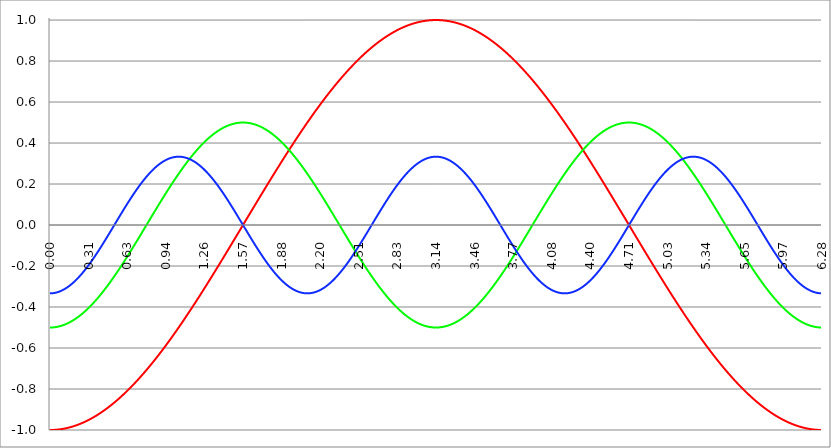
| Category | Series 1 | Series 0 | Series 2 |
|---|---|---|---|
| 0.0 | -1 | -0.5 | -0.333 |
| 0.00314159265358979 | -1 | -0.5 | -0.333 |
| 0.00628318530717958 | -1 | -0.5 | -0.333 |
| 0.00942477796076938 | -1 | -0.5 | -0.333 |
| 0.0125663706143592 | -1 | -0.5 | -0.333 |
| 0.015707963267949 | -1 | -0.5 | -0.333 |
| 0.0188495559215388 | -1 | -0.5 | -0.333 |
| 0.0219911485751285 | -1 | -0.5 | -0.333 |
| 0.0251327412287183 | -1 | -0.499 | -0.332 |
| 0.0282743338823081 | -1 | -0.499 | -0.332 |
| 0.0314159265358979 | -1 | -0.499 | -0.332 |
| 0.0345575191894877 | -0.999 | -0.499 | -0.332 |
| 0.0376991118430775 | -0.999 | -0.499 | -0.331 |
| 0.0408407044966673 | -0.999 | -0.498 | -0.331 |
| 0.0439822971502571 | -0.999 | -0.498 | -0.33 |
| 0.0471238898038469 | -0.999 | -0.498 | -0.33 |
| 0.0502654824574367 | -0.999 | -0.497 | -0.33 |
| 0.0534070751110265 | -0.999 | -0.497 | -0.329 |
| 0.0565486677646163 | -0.998 | -0.497 | -0.329 |
| 0.059690260418206 | -0.998 | -0.496 | -0.328 |
| 0.0628318530717958 | -0.998 | -0.496 | -0.327 |
| 0.0659734457253856 | -0.998 | -0.496 | -0.327 |
| 0.0691150383789754 | -0.998 | -0.495 | -0.326 |
| 0.0722566310325652 | -0.997 | -0.495 | -0.326 |
| 0.075398223686155 | -0.997 | -0.494 | -0.325 |
| 0.0785398163397448 | -0.997 | -0.494 | -0.324 |
| 0.0816814089933346 | -0.997 | -0.493 | -0.323 |
| 0.0848230016469244 | -0.996 | -0.493 | -0.323 |
| 0.0879645943005142 | -0.996 | -0.492 | -0.322 |
| 0.091106186954104 | -0.996 | -0.492 | -0.321 |
| 0.0942477796076937 | -0.996 | -0.491 | -0.32 |
| 0.0973893722612835 | -0.995 | -0.491 | -0.319 |
| 0.100530964914873 | -0.995 | -0.49 | -0.318 |
| 0.103672557568463 | -0.995 | -0.489 | -0.317 |
| 0.106814150222053 | -0.994 | -0.489 | -0.316 |
| 0.109955742875643 | -0.994 | -0.488 | -0.315 |
| 0.113097335529233 | -0.994 | -0.487 | -0.314 |
| 0.116238928182822 | -0.993 | -0.487 | -0.313 |
| 0.119380520836412 | -0.993 | -0.486 | -0.312 |
| 0.122522113490002 | -0.993 | -0.485 | -0.311 |
| 0.125663706143592 | -0.992 | -0.484 | -0.31 |
| 0.128805298797181 | -0.992 | -0.484 | -0.309 |
| 0.131946891450771 | -0.991 | -0.483 | -0.308 |
| 0.135088484104361 | -0.991 | -0.482 | -0.306 |
| 0.138230076757951 | -0.99 | -0.481 | -0.305 |
| 0.141371669411541 | -0.99 | -0.48 | -0.304 |
| 0.14451326206513 | -0.99 | -0.479 | -0.302 |
| 0.14765485471872 | -0.989 | -0.478 | -0.301 |
| 0.15079644737231 | -0.989 | -0.477 | -0.3 |
| 0.1539380400259 | -0.988 | -0.476 | -0.298 |
| 0.15707963267949 | -0.988 | -0.476 | -0.297 |
| 0.160221225333079 | -0.987 | -0.475 | -0.296 |
| 0.163362817986669 | -0.987 | -0.474 | -0.294 |
| 0.166504410640259 | -0.986 | -0.473 | -0.293 |
| 0.169646003293849 | -0.986 | -0.471 | -0.291 |
| 0.172787595947439 | -0.985 | -0.47 | -0.29 |
| 0.175929188601028 | -0.985 | -0.469 | -0.288 |
| 0.179070781254618 | -0.984 | -0.468 | -0.286 |
| 0.182212373908208 | -0.983 | -0.467 | -0.285 |
| 0.185353966561798 | -0.983 | -0.466 | -0.283 |
| 0.188495559215388 | -0.982 | -0.465 | -0.281 |
| 0.191637151868977 | -0.982 | -0.464 | -0.28 |
| 0.194778744522567 | -0.981 | -0.463 | -0.278 |
| 0.197920337176157 | -0.98 | -0.461 | -0.276 |
| 0.201061929829747 | -0.98 | -0.46 | -0.275 |
| 0.204203522483336 | -0.979 | -0.459 | -0.273 |
| 0.207345115136926 | -0.979 | -0.458 | -0.271 |
| 0.210486707790516 | -0.978 | -0.456 | -0.269 |
| 0.213628300444106 | -0.977 | -0.455 | -0.267 |
| 0.216769893097696 | -0.977 | -0.454 | -0.265 |
| 0.219911485751285 | -0.976 | -0.452 | -0.263 |
| 0.223053078404875 | -0.975 | -0.451 | -0.261 |
| 0.226194671058465 | -0.975 | -0.45 | -0.259 |
| 0.229336263712055 | -0.974 | -0.448 | -0.258 |
| 0.232477856365645 | -0.973 | -0.447 | -0.255 |
| 0.235619449019234 | -0.972 | -0.446 | -0.253 |
| 0.238761041672824 | -0.972 | -0.444 | -0.251 |
| 0.241902634326414 | -0.971 | -0.443 | -0.249 |
| 0.245044226980004 | -0.97 | -0.441 | -0.247 |
| 0.248185819633594 | -0.969 | -0.44 | -0.245 |
| 0.251327412287183 | -0.969 | -0.438 | -0.243 |
| 0.254469004940773 | -0.968 | -0.437 | -0.241 |
| 0.257610597594363 | -0.967 | -0.435 | -0.239 |
| 0.260752190247953 | -0.966 | -0.434 | -0.236 |
| 0.263893782901543 | -0.965 | -0.432 | -0.234 |
| 0.267035375555132 | -0.965 | -0.43 | -0.232 |
| 0.270176968208722 | -0.964 | -0.429 | -0.23 |
| 0.273318560862312 | -0.963 | -0.427 | -0.227 |
| 0.276460153515902 | -0.962 | -0.425 | -0.225 |
| 0.279601746169492 | -0.961 | -0.424 | -0.223 |
| 0.282743338823082 | -0.96 | -0.422 | -0.22 |
| 0.285884931476671 | -0.959 | -0.42 | -0.218 |
| 0.289026524130261 | -0.959 | -0.419 | -0.216 |
| 0.292168116783851 | -0.958 | -0.417 | -0.213 |
| 0.295309709437441 | -0.957 | -0.415 | -0.211 |
| 0.298451302091031 | -0.956 | -0.414 | -0.208 |
| 0.30159289474462 | -0.955 | -0.412 | -0.206 |
| 0.30473448739821 | -0.954 | -0.41 | -0.203 |
| 0.3078760800518 | -0.953 | -0.408 | -0.201 |
| 0.31101767270539 | -0.952 | -0.406 | -0.198 |
| 0.31415926535898 | -0.951 | -0.405 | -0.196 |
| 0.31730085801257 | -0.95 | -0.403 | -0.193 |
| 0.320442450666159 | -0.949 | -0.401 | -0.191 |
| 0.323584043319749 | -0.948 | -0.399 | -0.188 |
| 0.326725635973339 | -0.947 | -0.397 | -0.186 |
| 0.329867228626929 | -0.946 | -0.395 | -0.183 |
| 0.333008821280519 | -0.945 | -0.393 | -0.18 |
| 0.336150413934108 | -0.944 | -0.391 | -0.178 |
| 0.339292006587698 | -0.943 | -0.389 | -0.175 |
| 0.342433599241288 | -0.942 | -0.387 | -0.172 |
| 0.345575191894878 | -0.941 | -0.385 | -0.17 |
| 0.348716784548468 | -0.94 | -0.383 | -0.167 |
| 0.351858377202058 | -0.939 | -0.381 | -0.164 |
| 0.354999969855647 | -0.938 | -0.379 | -0.162 |
| 0.358141562509237 | -0.937 | -0.377 | -0.159 |
| 0.361283155162827 | -0.935 | -0.375 | -0.156 |
| 0.364424747816417 | -0.934 | -0.373 | -0.153 |
| 0.367566340470007 | -0.933 | -0.371 | -0.15 |
| 0.370707933123597 | -0.932 | -0.369 | -0.148 |
| 0.373849525777186 | -0.931 | -0.367 | -0.145 |
| 0.376991118430776 | -0.93 | -0.364 | -0.142 |
| 0.380132711084366 | -0.929 | -0.362 | -0.139 |
| 0.383274303737956 | -0.927 | -0.36 | -0.136 |
| 0.386415896391546 | -0.926 | -0.358 | -0.133 |
| 0.389557489045135 | -0.925 | -0.356 | -0.13 |
| 0.392699081698725 | -0.924 | -0.354 | -0.128 |
| 0.395840674352315 | -0.923 | -0.351 | -0.125 |
| 0.398982267005905 | -0.921 | -0.349 | -0.122 |
| 0.402123859659495 | -0.92 | -0.347 | -0.119 |
| 0.405265452313085 | -0.919 | -0.345 | -0.116 |
| 0.408407044966674 | -0.918 | -0.342 | -0.113 |
| 0.411548637620264 | -0.917 | -0.34 | -0.11 |
| 0.414690230273854 | -0.915 | -0.338 | -0.107 |
| 0.417831822927444 | -0.914 | -0.335 | -0.104 |
| 0.420973415581034 | -0.913 | -0.333 | -0.101 |
| 0.424115008234623 | -0.911 | -0.331 | -0.098 |
| 0.427256600888213 | -0.91 | -0.328 | -0.095 |
| 0.430398193541803 | -0.909 | -0.326 | -0.092 |
| 0.433539786195393 | -0.907 | -0.324 | -0.089 |
| 0.436681378848983 | -0.906 | -0.321 | -0.086 |
| 0.439822971502573 | -0.905 | -0.319 | -0.083 |
| 0.442964564156162 | -0.903 | -0.316 | -0.08 |
| 0.446106156809752 | -0.902 | -0.314 | -0.077 |
| 0.449247749463342 | -0.901 | -0.311 | -0.074 |
| 0.452389342116932 | -0.899 | -0.309 | -0.071 |
| 0.455530934770522 | -0.898 | -0.306 | -0.068 |
| 0.458672527424111 | -0.897 | -0.304 | -0.065 |
| 0.461814120077701 | -0.895 | -0.301 | -0.061 |
| 0.464955712731291 | -0.894 | -0.299 | -0.058 |
| 0.468097305384881 | -0.892 | -0.296 | -0.055 |
| 0.471238898038471 | -0.891 | -0.294 | -0.052 |
| 0.474380490692061 | -0.89 | -0.291 | -0.049 |
| 0.47752208334565 | -0.888 | -0.289 | -0.046 |
| 0.48066367599924 | -0.887 | -0.286 | -0.043 |
| 0.48380526865283 | -0.885 | -0.284 | -0.04 |
| 0.48694686130642 | -0.884 | -0.281 | -0.037 |
| 0.49008845396001 | -0.882 | -0.278 | -0.033 |
| 0.493230046613599 | -0.881 | -0.276 | -0.03 |
| 0.496371639267189 | -0.879 | -0.273 | -0.027 |
| 0.499513231920779 | -0.878 | -0.271 | -0.024 |
| 0.502654824574369 | -0.876 | -0.268 | -0.021 |
| 0.505796417227959 | -0.875 | -0.265 | -0.018 |
| 0.508938009881549 | -0.873 | -0.263 | -0.015 |
| 0.512079602535138 | -0.872 | -0.26 | -0.012 |
| 0.515221195188728 | -0.87 | -0.257 | -0.008 |
| 0.518362787842318 | -0.869 | -0.255 | -0.005 |
| 0.521504380495908 | -0.867 | -0.252 | -0.002 |
| 0.524645973149498 | -0.866 | -0.249 | 0.001 |
| 0.527787565803087 | -0.864 | -0.246 | 0.004 |
| 0.530929158456677 | -0.862 | -0.244 | 0.007 |
| 0.534070751110267 | -0.861 | -0.241 | 0.01 |
| 0.537212343763857 | -0.859 | -0.238 | 0.014 |
| 0.540353936417447 | -0.858 | -0.235 | 0.017 |
| 0.543495529071037 | -0.856 | -0.233 | 0.02 |
| 0.546637121724626 | -0.854 | -0.23 | 0.023 |
| 0.549778714378216 | -0.853 | -0.227 | 0.026 |
| 0.552920307031806 | -0.851 | -0.224 | 0.029 |
| 0.556061899685396 | -0.849 | -0.221 | 0.032 |
| 0.559203492338986 | -0.848 | -0.219 | 0.036 |
| 0.562345084992576 | -0.846 | -0.216 | 0.039 |
| 0.565486677646165 | -0.844 | -0.213 | 0.042 |
| 0.568628270299755 | -0.843 | -0.21 | 0.045 |
| 0.571769862953345 | -0.841 | -0.207 | 0.048 |
| 0.574911455606935 | -0.839 | -0.204 | 0.051 |
| 0.578053048260525 | -0.838 | -0.201 | 0.054 |
| 0.581194640914114 | -0.836 | -0.199 | 0.057 |
| 0.584336233567704 | -0.834 | -0.196 | 0.06 |
| 0.587477826221294 | -0.832 | -0.193 | 0.063 |
| 0.590619418874884 | -0.831 | -0.19 | 0.067 |
| 0.593761011528474 | -0.829 | -0.187 | 0.07 |
| 0.596902604182064 | -0.827 | -0.184 | 0.073 |
| 0.600044196835653 | -0.825 | -0.181 | 0.076 |
| 0.603185789489243 | -0.824 | -0.178 | 0.079 |
| 0.606327382142833 | -0.822 | -0.175 | 0.082 |
| 0.609468974796423 | -0.82 | -0.172 | 0.085 |
| 0.612610567450013 | -0.818 | -0.169 | 0.088 |
| 0.615752160103602 | -0.816 | -0.166 | 0.091 |
| 0.618893752757192 | -0.815 | -0.163 | 0.094 |
| 0.622035345410782 | -0.813 | -0.16 | 0.097 |
| 0.625176938064372 | -0.811 | -0.157 | 0.1 |
| 0.628318530717962 | -0.809 | -0.155 | 0.103 |
| 0.631460123371551 | -0.807 | -0.152 | 0.106 |
| 0.634601716025141 | -0.805 | -0.149 | 0.109 |
| 0.637743308678731 | -0.803 | -0.146 | 0.112 |
| 0.640884901332321 | -0.802 | -0.143 | 0.115 |
| 0.644026493985911 | -0.8 | -0.139 | 0.118 |
| 0.647168086639501 | -0.798 | -0.136 | 0.121 |
| 0.65030967929309 | -0.796 | -0.133 | 0.124 |
| 0.65345127194668 | -0.794 | -0.13 | 0.127 |
| 0.65659286460027 | -0.792 | -0.127 | 0.129 |
| 0.65973445725386 | -0.79 | -0.124 | 0.132 |
| 0.66287604990745 | -0.788 | -0.121 | 0.135 |
| 0.666017642561039 | -0.786 | -0.118 | 0.138 |
| 0.669159235214629 | -0.784 | -0.115 | 0.141 |
| 0.672300827868219 | -0.782 | -0.112 | 0.144 |
| 0.675442420521809 | -0.78 | -0.109 | 0.147 |
| 0.678584013175399 | -0.778 | -0.106 | 0.149 |
| 0.681725605828989 | -0.776 | -0.103 | 0.152 |
| 0.684867198482578 | -0.775 | -0.1 | 0.155 |
| 0.688008791136168 | -0.773 | -0.097 | 0.158 |
| 0.691150383789758 | -0.771 | -0.094 | 0.161 |
| 0.694291976443348 | -0.769 | -0.091 | 0.163 |
| 0.697433569096938 | -0.766 | -0.088 | 0.166 |
| 0.700575161750528 | -0.764 | -0.084 | 0.169 |
| 0.703716754404117 | -0.762 | -0.081 | 0.171 |
| 0.706858347057707 | -0.76 | -0.078 | 0.174 |
| 0.709999939711297 | -0.758 | -0.075 | 0.177 |
| 0.713141532364887 | -0.756 | -0.072 | 0.179 |
| 0.716283125018477 | -0.754 | -0.069 | 0.182 |
| 0.719424717672066 | -0.752 | -0.066 | 0.185 |
| 0.722566310325656 | -0.75 | -0.063 | 0.187 |
| 0.725707902979246 | -0.748 | -0.06 | 0.19 |
| 0.728849495632836 | -0.746 | -0.056 | 0.193 |
| 0.731991088286426 | -0.744 | -0.053 | 0.195 |
| 0.735132680940016 | -0.742 | -0.05 | 0.198 |
| 0.738274273593605 | -0.74 | -0.047 | 0.2 |
| 0.741415866247195 | -0.738 | -0.044 | 0.203 |
| 0.744557458900785 | -0.735 | -0.041 | 0.205 |
| 0.747699051554375 | -0.733 | -0.038 | 0.208 |
| 0.750840644207965 | -0.731 | -0.035 | 0.21 |
| 0.753982236861554 | -0.729 | -0.031 | 0.212 |
| 0.757123829515144 | -0.727 | -0.028 | 0.215 |
| 0.760265422168734 | -0.725 | -0.025 | 0.217 |
| 0.763407014822324 | -0.722 | -0.022 | 0.22 |
| 0.766548607475914 | -0.72 | -0.019 | 0.222 |
| 0.769690200129504 | -0.718 | -0.016 | 0.224 |
| 0.772831792783093 | -0.716 | -0.013 | 0.227 |
| 0.775973385436683 | -0.714 | -0.009 | 0.229 |
| 0.779114978090273 | -0.712 | -0.006 | 0.231 |
| 0.782256570743863 | -0.709 | -0.003 | 0.233 |
| 0.785398163397453 | -0.707 | 0 | 0.236 |
| 0.788539756051042 | -0.705 | 0.003 | 0.238 |
| 0.791681348704632 | -0.703 | 0.006 | 0.24 |
| 0.794822941358222 | -0.7 | 0.009 | 0.242 |
| 0.797964534011812 | -0.698 | 0.013 | 0.244 |
| 0.801106126665402 | -0.696 | 0.016 | 0.247 |
| 0.804247719318992 | -0.694 | 0.019 | 0.249 |
| 0.807389311972581 | -0.691 | 0.022 | 0.251 |
| 0.810530904626171 | -0.689 | 0.025 | 0.253 |
| 0.813672497279761 | -0.687 | 0.028 | 0.255 |
| 0.816814089933351 | -0.685 | 0.031 | 0.257 |
| 0.819955682586941 | -0.682 | 0.035 | 0.259 |
| 0.823097275240531 | -0.68 | 0.038 | 0.261 |
| 0.82623886789412 | -0.678 | 0.041 | 0.263 |
| 0.82938046054771 | -0.675 | 0.044 | 0.265 |
| 0.8325220532013 | -0.673 | 0.047 | 0.267 |
| 0.83566364585489 | -0.671 | 0.05 | 0.268 |
| 0.83880523850848 | -0.668 | 0.053 | 0.27 |
| 0.841946831162069 | -0.666 | 0.056 | 0.272 |
| 0.845088423815659 | -0.664 | 0.06 | 0.274 |
| 0.848230016469249 | -0.661 | 0.063 | 0.276 |
| 0.851371609122839 | -0.659 | 0.066 | 0.277 |
| 0.854513201776429 | -0.657 | 0.069 | 0.279 |
| 0.857654794430019 | -0.654 | 0.072 | 0.281 |
| 0.860796387083608 | -0.652 | 0.075 | 0.283 |
| 0.863937979737198 | -0.649 | 0.078 | 0.284 |
| 0.867079572390788 | -0.647 | 0.081 | 0.286 |
| 0.870221165044378 | -0.645 | 0.084 | 0.287 |
| 0.873362757697968 | -0.642 | 0.088 | 0.289 |
| 0.876504350351557 | -0.64 | 0.091 | 0.291 |
| 0.879645943005147 | -0.637 | 0.094 | 0.292 |
| 0.882787535658737 | -0.635 | 0.097 | 0.294 |
| 0.885929128312327 | -0.633 | 0.1 | 0.295 |
| 0.889070720965917 | -0.63 | 0.103 | 0.297 |
| 0.892212313619507 | -0.628 | 0.106 | 0.298 |
| 0.895353906273096 | -0.625 | 0.109 | 0.299 |
| 0.898495498926686 | -0.623 | 0.112 | 0.301 |
| 0.901637091580276 | -0.62 | 0.115 | 0.302 |
| 0.904778684233866 | -0.618 | 0.118 | 0.303 |
| 0.907920276887456 | -0.615 | 0.121 | 0.305 |
| 0.911061869541045 | -0.613 | 0.124 | 0.306 |
| 0.914203462194635 | -0.61 | 0.127 | 0.307 |
| 0.917345054848225 | -0.608 | 0.13 | 0.308 |
| 0.920486647501815 | -0.605 | 0.133 | 0.31 |
| 0.923628240155405 | -0.603 | 0.136 | 0.311 |
| 0.926769832808995 | -0.6 | 0.139 | 0.312 |
| 0.929911425462584 | -0.598 | 0.143 | 0.313 |
| 0.933053018116174 | -0.595 | 0.146 | 0.314 |
| 0.936194610769764 | -0.593 | 0.149 | 0.315 |
| 0.939336203423354 | -0.59 | 0.152 | 0.316 |
| 0.942477796076944 | -0.588 | 0.155 | 0.317 |
| 0.945619388730533 | -0.585 | 0.157 | 0.318 |
| 0.948760981384123 | -0.583 | 0.16 | 0.319 |
| 0.951902574037713 | -0.58 | 0.163 | 0.32 |
| 0.955044166691303 | -0.578 | 0.166 | 0.321 |
| 0.958185759344893 | -0.575 | 0.169 | 0.322 |
| 0.961327351998483 | -0.572 | 0.172 | 0.322 |
| 0.964468944652072 | -0.57 | 0.175 | 0.323 |
| 0.967610537305662 | -0.567 | 0.178 | 0.324 |
| 0.970752129959252 | -0.565 | 0.181 | 0.325 |
| 0.973893722612842 | -0.562 | 0.184 | 0.325 |
| 0.977035315266432 | -0.559 | 0.187 | 0.326 |
| 0.980176907920022 | -0.557 | 0.19 | 0.327 |
| 0.983318500573611 | -0.554 | 0.193 | 0.327 |
| 0.986460093227201 | -0.552 | 0.196 | 0.328 |
| 0.989601685880791 | -0.549 | 0.199 | 0.328 |
| 0.992743278534381 | -0.546 | 0.201 | 0.329 |
| 0.995884871187971 | -0.544 | 0.204 | 0.329 |
| 0.99902646384156 | -0.541 | 0.207 | 0.33 |
| 1.00216805649515 | -0.538 | 0.21 | 0.33 |
| 1.00530964914874 | -0.536 | 0.213 | 0.331 |
| 1.00845124180233 | -0.533 | 0.216 | 0.331 |
| 1.01159283445592 | -0.531 | 0.219 | 0.331 |
| 1.01473442710951 | -0.528 | 0.221 | 0.332 |
| 1.017876019763099 | -0.525 | 0.224 | 0.332 |
| 1.021017612416689 | -0.522 | 0.227 | 0.332 |
| 1.02415920507028 | -0.52 | 0.23 | 0.333 |
| 1.027300797723869 | -0.517 | 0.233 | 0.333 |
| 1.030442390377459 | -0.514 | 0.235 | 0.333 |
| 1.033583983031048 | -0.512 | 0.238 | 0.333 |
| 1.036725575684638 | -0.509 | 0.241 | 0.333 |
| 1.039867168338228 | -0.506 | 0.244 | 0.333 |
| 1.043008760991818 | -0.504 | 0.246 | 0.333 |
| 1.046150353645408 | -0.501 | 0.249 | 0.333 |
| 1.049291946298998 | -0.498 | 0.252 | 0.333 |
| 1.052433538952587 | -0.495 | 0.255 | 0.333 |
| 1.055575131606177 | -0.493 | 0.257 | 0.333 |
| 1.058716724259767 | -0.49 | 0.26 | 0.333 |
| 1.061858316913357 | -0.487 | 0.263 | 0.333 |
| 1.064999909566947 | -0.485 | 0.265 | 0.333 |
| 1.068141502220536 | -0.482 | 0.268 | 0.333 |
| 1.071283094874126 | -0.479 | 0.271 | 0.332 |
| 1.074424687527716 | -0.476 | 0.273 | 0.332 |
| 1.077566280181306 | -0.473 | 0.276 | 0.332 |
| 1.080707872834896 | -0.471 | 0.278 | 0.332 |
| 1.083849465488486 | -0.468 | 0.281 | 0.331 |
| 1.086991058142075 | -0.465 | 0.284 | 0.331 |
| 1.090132650795665 | -0.462 | 0.286 | 0.331 |
| 1.093274243449255 | -0.46 | 0.289 | 0.33 |
| 1.096415836102845 | -0.457 | 0.291 | 0.33 |
| 1.099557428756435 | -0.454 | 0.294 | 0.329 |
| 1.102699021410025 | -0.451 | 0.296 | 0.329 |
| 1.105840614063614 | -0.448 | 0.299 | 0.328 |
| 1.108982206717204 | -0.446 | 0.301 | 0.328 |
| 1.112123799370794 | -0.443 | 0.304 | 0.327 |
| 1.115265392024384 | -0.44 | 0.306 | 0.326 |
| 1.118406984677974 | -0.437 | 0.309 | 0.326 |
| 1.121548577331563 | -0.434 | 0.311 | 0.325 |
| 1.124690169985153 | -0.431 | 0.314 | 0.324 |
| 1.127831762638743 | -0.429 | 0.316 | 0.324 |
| 1.130973355292333 | -0.426 | 0.319 | 0.323 |
| 1.134114947945923 | -0.423 | 0.321 | 0.322 |
| 1.137256540599513 | -0.42 | 0.324 | 0.321 |
| 1.140398133253102 | -0.417 | 0.326 | 0.32 |
| 1.143539725906692 | -0.414 | 0.328 | 0.32 |
| 1.146681318560282 | -0.412 | 0.331 | 0.319 |
| 1.149822911213872 | -0.409 | 0.333 | 0.318 |
| 1.152964503867462 | -0.406 | 0.335 | 0.317 |
| 1.156106096521051 | -0.403 | 0.338 | 0.316 |
| 1.159247689174641 | -0.4 | 0.34 | 0.315 |
| 1.162389281828231 | -0.397 | 0.342 | 0.314 |
| 1.165530874481821 | -0.394 | 0.345 | 0.313 |
| 1.168672467135411 | -0.391 | 0.347 | 0.311 |
| 1.171814059789001 | -0.388 | 0.349 | 0.31 |
| 1.17495565244259 | -0.386 | 0.351 | 0.309 |
| 1.17809724509618 | -0.383 | 0.354 | 0.308 |
| 1.18123883774977 | -0.38 | 0.356 | 0.307 |
| 1.18438043040336 | -0.377 | 0.358 | 0.306 |
| 1.18752202305695 | -0.374 | 0.36 | 0.304 |
| 1.190663615710539 | -0.371 | 0.362 | 0.303 |
| 1.193805208364129 | -0.368 | 0.364 | 0.302 |
| 1.19694680101772 | -0.365 | 0.367 | 0.3 |
| 1.200088393671309 | -0.362 | 0.369 | 0.299 |
| 1.203229986324899 | -0.359 | 0.371 | 0.297 |
| 1.206371578978489 | -0.356 | 0.373 | 0.296 |
| 1.209513171632078 | -0.353 | 0.375 | 0.295 |
| 1.212654764285668 | -0.351 | 0.377 | 0.293 |
| 1.215796356939258 | -0.348 | 0.379 | 0.292 |
| 1.218937949592848 | -0.345 | 0.381 | 0.29 |
| 1.222079542246438 | -0.342 | 0.383 | 0.289 |
| 1.225221134900027 | -0.339 | 0.385 | 0.287 |
| 1.228362727553617 | -0.336 | 0.387 | 0.285 |
| 1.231504320207207 | -0.333 | 0.389 | 0.284 |
| 1.234645912860797 | -0.33 | 0.391 | 0.282 |
| 1.237787505514387 | -0.327 | 0.393 | 0.28 |
| 1.240929098167977 | -0.324 | 0.395 | 0.279 |
| 1.244070690821566 | -0.321 | 0.397 | 0.277 |
| 1.247212283475156 | -0.318 | 0.399 | 0.275 |
| 1.250353876128746 | -0.315 | 0.401 | 0.273 |
| 1.253495468782336 | -0.312 | 0.403 | 0.272 |
| 1.256637061435926 | -0.309 | 0.405 | 0.27 |
| 1.259778654089515 | -0.306 | 0.406 | 0.268 |
| 1.262920246743105 | -0.303 | 0.408 | 0.266 |
| 1.266061839396695 | -0.3 | 0.41 | 0.264 |
| 1.269203432050285 | -0.297 | 0.412 | 0.262 |
| 1.272345024703875 | -0.294 | 0.414 | 0.26 |
| 1.275486617357465 | -0.291 | 0.415 | 0.258 |
| 1.278628210011054 | -0.288 | 0.417 | 0.256 |
| 1.281769802664644 | -0.285 | 0.419 | 0.254 |
| 1.284911395318234 | -0.282 | 0.42 | 0.252 |
| 1.288052987971824 | -0.279 | 0.422 | 0.25 |
| 1.291194580625414 | -0.276 | 0.424 | 0.248 |
| 1.294336173279003 | -0.273 | 0.425 | 0.246 |
| 1.297477765932593 | -0.27 | 0.427 | 0.244 |
| 1.300619358586183 | -0.267 | 0.429 | 0.242 |
| 1.303760951239773 | -0.264 | 0.43 | 0.239 |
| 1.306902543893363 | -0.261 | 0.432 | 0.237 |
| 1.310044136546953 | -0.258 | 0.434 | 0.235 |
| 1.313185729200542 | -0.255 | 0.435 | 0.233 |
| 1.316327321854132 | -0.252 | 0.437 | 0.23 |
| 1.319468914507722 | -0.249 | 0.438 | 0.228 |
| 1.322610507161312 | -0.246 | 0.44 | 0.226 |
| 1.325752099814902 | -0.243 | 0.441 | 0.224 |
| 1.328893692468491 | -0.24 | 0.443 | 0.221 |
| 1.332035285122081 | -0.236 | 0.444 | 0.219 |
| 1.335176877775671 | -0.233 | 0.446 | 0.216 |
| 1.338318470429261 | -0.23 | 0.447 | 0.214 |
| 1.341460063082851 | -0.227 | 0.448 | 0.212 |
| 1.344601655736441 | -0.224 | 0.45 | 0.209 |
| 1.34774324839003 | -0.221 | 0.451 | 0.207 |
| 1.35088484104362 | -0.218 | 0.452 | 0.204 |
| 1.35402643369721 | -0.215 | 0.454 | 0.202 |
| 1.3571680263508 | -0.212 | 0.455 | 0.199 |
| 1.36030961900439 | -0.209 | 0.456 | 0.197 |
| 1.363451211657979 | -0.206 | 0.458 | 0.194 |
| 1.36659280431157 | -0.203 | 0.459 | 0.192 |
| 1.369734396965159 | -0.2 | 0.46 | 0.189 |
| 1.372875989618749 | -0.197 | 0.461 | 0.186 |
| 1.376017582272339 | -0.194 | 0.463 | 0.184 |
| 1.379159174925929 | -0.19 | 0.464 | 0.181 |
| 1.382300767579518 | -0.187 | 0.465 | 0.179 |
| 1.385442360233108 | -0.184 | 0.466 | 0.176 |
| 1.388583952886698 | -0.181 | 0.467 | 0.173 |
| 1.391725545540288 | -0.178 | 0.468 | 0.171 |
| 1.394867138193878 | -0.175 | 0.469 | 0.168 |
| 1.398008730847468 | -0.172 | 0.47 | 0.165 |
| 1.401150323501057 | -0.169 | 0.471 | 0.162 |
| 1.404291916154647 | -0.166 | 0.473 | 0.16 |
| 1.407433508808237 | -0.163 | 0.474 | 0.157 |
| 1.410575101461827 | -0.16 | 0.475 | 0.154 |
| 1.413716694115417 | -0.156 | 0.476 | 0.151 |
| 1.416858286769006 | -0.153 | 0.476 | 0.149 |
| 1.419999879422596 | -0.15 | 0.477 | 0.146 |
| 1.423141472076186 | -0.147 | 0.478 | 0.143 |
| 1.426283064729776 | -0.144 | 0.479 | 0.14 |
| 1.429424657383366 | -0.141 | 0.48 | 0.137 |
| 1.432566250036956 | -0.138 | 0.481 | 0.134 |
| 1.435707842690545 | -0.135 | 0.482 | 0.131 |
| 1.438849435344135 | -0.132 | 0.483 | 0.129 |
| 1.441991027997725 | -0.128 | 0.484 | 0.126 |
| 1.445132620651315 | -0.125 | 0.484 | 0.123 |
| 1.448274213304905 | -0.122 | 0.485 | 0.12 |
| 1.451415805958494 | -0.119 | 0.486 | 0.117 |
| 1.454557398612084 | -0.116 | 0.487 | 0.114 |
| 1.457698991265674 | -0.113 | 0.487 | 0.111 |
| 1.460840583919264 | -0.11 | 0.488 | 0.108 |
| 1.463982176572854 | -0.107 | 0.489 | 0.105 |
| 1.467123769226444 | -0.103 | 0.489 | 0.102 |
| 1.470265361880033 | -0.1 | 0.49 | 0.099 |
| 1.473406954533623 | -0.097 | 0.491 | 0.096 |
| 1.476548547187213 | -0.094 | 0.491 | 0.093 |
| 1.479690139840803 | -0.091 | 0.492 | 0.09 |
| 1.482831732494393 | -0.088 | 0.492 | 0.087 |
| 1.485973325147982 | -0.085 | 0.493 | 0.084 |
| 1.489114917801572 | -0.082 | 0.493 | 0.081 |
| 1.492256510455162 | -0.078 | 0.494 | 0.078 |
| 1.495398103108752 | -0.075 | 0.494 | 0.075 |
| 1.498539695762342 | -0.072 | 0.495 | 0.072 |
| 1.501681288415932 | -0.069 | 0.495 | 0.069 |
| 1.504822881069521 | -0.066 | 0.496 | 0.066 |
| 1.507964473723111 | -0.063 | 0.496 | 0.062 |
| 1.511106066376701 | -0.06 | 0.496 | 0.059 |
| 1.514247659030291 | -0.057 | 0.497 | 0.056 |
| 1.517389251683881 | -0.053 | 0.497 | 0.053 |
| 1.520530844337471 | -0.05 | 0.497 | 0.05 |
| 1.52367243699106 | -0.047 | 0.498 | 0.047 |
| 1.52681402964465 | -0.044 | 0.498 | 0.044 |
| 1.52995562229824 | -0.041 | 0.498 | 0.041 |
| 1.53309721495183 | -0.038 | 0.499 | 0.038 |
| 1.53623880760542 | -0.035 | 0.499 | 0.034 |
| 1.539380400259009 | -0.031 | 0.499 | 0.031 |
| 1.542521992912599 | -0.028 | 0.499 | 0.028 |
| 1.545663585566189 | -0.025 | 0.499 | 0.025 |
| 1.548805178219779 | -0.022 | 0.5 | 0.022 |
| 1.551946770873369 | -0.019 | 0.5 | 0.019 |
| 1.555088363526959 | -0.016 | 0.5 | 0.016 |
| 1.558229956180548 | -0.013 | 0.5 | 0.013 |
| 1.561371548834138 | -0.009 | 0.5 | 0.009 |
| 1.564513141487728 | -0.006 | 0.5 | 0.006 |
| 1.567654734141318 | -0.003 | 0.5 | 0.003 |
| 1.570796326794908 | 0 | 0.5 | 0 |
| 1.573937919448497 | 0.003 | 0.5 | -0.003 |
| 1.577079512102087 | 0.006 | 0.5 | -0.006 |
| 1.580221104755677 | 0.009 | 0.5 | -0.009 |
| 1.583362697409267 | 0.013 | 0.5 | -0.013 |
| 1.586504290062857 | 0.016 | 0.5 | -0.016 |
| 1.589645882716447 | 0.019 | 0.5 | -0.019 |
| 1.592787475370036 | 0.022 | 0.5 | -0.022 |
| 1.595929068023626 | 0.025 | 0.499 | -0.025 |
| 1.599070660677216 | 0.028 | 0.499 | -0.028 |
| 1.602212253330806 | 0.031 | 0.499 | -0.031 |
| 1.605353845984396 | 0.035 | 0.499 | -0.034 |
| 1.608495438637985 | 0.038 | 0.499 | -0.038 |
| 1.611637031291575 | 0.041 | 0.498 | -0.041 |
| 1.614778623945165 | 0.044 | 0.498 | -0.044 |
| 1.617920216598755 | 0.047 | 0.498 | -0.047 |
| 1.621061809252345 | 0.05 | 0.497 | -0.05 |
| 1.624203401905935 | 0.053 | 0.497 | -0.053 |
| 1.627344994559524 | 0.057 | 0.497 | -0.056 |
| 1.630486587213114 | 0.06 | 0.496 | -0.059 |
| 1.633628179866704 | 0.063 | 0.496 | -0.062 |
| 1.636769772520294 | 0.066 | 0.496 | -0.066 |
| 1.639911365173884 | 0.069 | 0.495 | -0.069 |
| 1.643052957827473 | 0.072 | 0.495 | -0.072 |
| 1.646194550481063 | 0.075 | 0.494 | -0.075 |
| 1.649336143134653 | 0.078 | 0.494 | -0.078 |
| 1.652477735788243 | 0.082 | 0.493 | -0.081 |
| 1.655619328441833 | 0.085 | 0.493 | -0.084 |
| 1.658760921095423 | 0.088 | 0.492 | -0.087 |
| 1.661902513749012 | 0.091 | 0.492 | -0.09 |
| 1.665044106402602 | 0.094 | 0.491 | -0.093 |
| 1.668185699056192 | 0.097 | 0.491 | -0.096 |
| 1.671327291709782 | 0.1 | 0.49 | -0.099 |
| 1.674468884363372 | 0.103 | 0.489 | -0.102 |
| 1.677610477016961 | 0.107 | 0.489 | -0.105 |
| 1.680752069670551 | 0.11 | 0.488 | -0.108 |
| 1.683893662324141 | 0.113 | 0.487 | -0.111 |
| 1.687035254977731 | 0.116 | 0.487 | -0.114 |
| 1.690176847631321 | 0.119 | 0.486 | -0.117 |
| 1.693318440284911 | 0.122 | 0.485 | -0.12 |
| 1.6964600329385 | 0.125 | 0.484 | -0.123 |
| 1.69960162559209 | 0.128 | 0.484 | -0.126 |
| 1.70274321824568 | 0.132 | 0.483 | -0.129 |
| 1.70588481089927 | 0.135 | 0.482 | -0.131 |
| 1.70902640355286 | 0.138 | 0.481 | -0.134 |
| 1.712167996206449 | 0.141 | 0.48 | -0.137 |
| 1.715309588860039 | 0.144 | 0.479 | -0.14 |
| 1.71845118151363 | 0.147 | 0.478 | -0.143 |
| 1.721592774167219 | 0.15 | 0.477 | -0.146 |
| 1.724734366820809 | 0.153 | 0.476 | -0.149 |
| 1.727875959474399 | 0.156 | 0.476 | -0.151 |
| 1.731017552127988 | 0.16 | 0.475 | -0.154 |
| 1.734159144781578 | 0.163 | 0.474 | -0.157 |
| 1.737300737435168 | 0.166 | 0.473 | -0.16 |
| 1.740442330088758 | 0.169 | 0.471 | -0.162 |
| 1.743583922742348 | 0.172 | 0.47 | -0.165 |
| 1.746725515395937 | 0.175 | 0.469 | -0.168 |
| 1.749867108049527 | 0.178 | 0.468 | -0.171 |
| 1.753008700703117 | 0.181 | 0.467 | -0.173 |
| 1.756150293356707 | 0.184 | 0.466 | -0.176 |
| 1.759291886010297 | 0.187 | 0.465 | -0.179 |
| 1.762433478663887 | 0.19 | 0.464 | -0.181 |
| 1.765575071317476 | 0.194 | 0.463 | -0.184 |
| 1.768716663971066 | 0.197 | 0.461 | -0.186 |
| 1.771858256624656 | 0.2 | 0.46 | -0.189 |
| 1.774999849278246 | 0.203 | 0.459 | -0.192 |
| 1.778141441931836 | 0.206 | 0.458 | -0.194 |
| 1.781283034585426 | 0.209 | 0.456 | -0.197 |
| 1.784424627239015 | 0.212 | 0.455 | -0.199 |
| 1.787566219892605 | 0.215 | 0.454 | -0.202 |
| 1.790707812546195 | 0.218 | 0.452 | -0.204 |
| 1.793849405199785 | 0.221 | 0.451 | -0.207 |
| 1.796990997853375 | 0.224 | 0.45 | -0.209 |
| 1.800132590506964 | 0.227 | 0.448 | -0.212 |
| 1.803274183160554 | 0.23 | 0.447 | -0.214 |
| 1.806415775814144 | 0.233 | 0.446 | -0.216 |
| 1.809557368467734 | 0.236 | 0.444 | -0.219 |
| 1.812698961121324 | 0.24 | 0.443 | -0.221 |
| 1.815840553774914 | 0.243 | 0.441 | -0.224 |
| 1.818982146428503 | 0.246 | 0.44 | -0.226 |
| 1.822123739082093 | 0.249 | 0.438 | -0.228 |
| 1.825265331735683 | 0.252 | 0.437 | -0.23 |
| 1.828406924389273 | 0.255 | 0.435 | -0.233 |
| 1.831548517042863 | 0.258 | 0.434 | -0.235 |
| 1.834690109696452 | 0.261 | 0.432 | -0.237 |
| 1.837831702350042 | 0.264 | 0.43 | -0.239 |
| 1.840973295003632 | 0.267 | 0.429 | -0.242 |
| 1.844114887657222 | 0.27 | 0.427 | -0.244 |
| 1.847256480310812 | 0.273 | 0.425 | -0.246 |
| 1.850398072964402 | 0.276 | 0.424 | -0.248 |
| 1.853539665617991 | 0.279 | 0.422 | -0.25 |
| 1.856681258271581 | 0.282 | 0.42 | -0.252 |
| 1.859822850925171 | 0.285 | 0.419 | -0.254 |
| 1.862964443578761 | 0.288 | 0.417 | -0.256 |
| 1.866106036232351 | 0.291 | 0.415 | -0.258 |
| 1.86924762888594 | 0.294 | 0.414 | -0.26 |
| 1.87238922153953 | 0.297 | 0.412 | -0.262 |
| 1.87553081419312 | 0.3 | 0.41 | -0.264 |
| 1.87867240684671 | 0.303 | 0.408 | -0.266 |
| 1.8818139995003 | 0.306 | 0.406 | -0.268 |
| 1.88495559215389 | 0.309 | 0.405 | -0.27 |
| 1.888097184807479 | 0.312 | 0.403 | -0.272 |
| 1.891238777461069 | 0.315 | 0.401 | -0.273 |
| 1.89438037011466 | 0.318 | 0.399 | -0.275 |
| 1.897521962768249 | 0.321 | 0.397 | -0.277 |
| 1.900663555421839 | 0.324 | 0.395 | -0.279 |
| 1.903805148075429 | 0.327 | 0.393 | -0.28 |
| 1.906946740729018 | 0.33 | 0.391 | -0.282 |
| 1.910088333382608 | 0.333 | 0.389 | -0.284 |
| 1.913229926036198 | 0.336 | 0.387 | -0.285 |
| 1.916371518689788 | 0.339 | 0.385 | -0.287 |
| 1.919513111343378 | 0.342 | 0.383 | -0.289 |
| 1.922654703996967 | 0.345 | 0.381 | -0.29 |
| 1.925796296650557 | 0.348 | 0.379 | -0.292 |
| 1.928937889304147 | 0.351 | 0.377 | -0.293 |
| 1.932079481957737 | 0.353 | 0.375 | -0.295 |
| 1.935221074611327 | 0.356 | 0.373 | -0.296 |
| 1.938362667264917 | 0.359 | 0.371 | -0.297 |
| 1.941504259918506 | 0.362 | 0.369 | -0.299 |
| 1.944645852572096 | 0.365 | 0.367 | -0.3 |
| 1.947787445225686 | 0.368 | 0.364 | -0.302 |
| 1.950929037879276 | 0.371 | 0.362 | -0.303 |
| 1.954070630532866 | 0.374 | 0.36 | -0.304 |
| 1.957212223186455 | 0.377 | 0.358 | -0.306 |
| 1.960353815840045 | 0.38 | 0.356 | -0.307 |
| 1.963495408493635 | 0.383 | 0.354 | -0.308 |
| 1.966637001147225 | 0.386 | 0.351 | -0.309 |
| 1.969778593800815 | 0.388 | 0.349 | -0.31 |
| 1.972920186454405 | 0.391 | 0.347 | -0.311 |
| 1.976061779107994 | 0.394 | 0.345 | -0.313 |
| 1.979203371761584 | 0.397 | 0.342 | -0.314 |
| 1.982344964415174 | 0.4 | 0.34 | -0.315 |
| 1.985486557068764 | 0.403 | 0.338 | -0.316 |
| 1.988628149722354 | 0.406 | 0.335 | -0.317 |
| 1.991769742375943 | 0.409 | 0.333 | -0.318 |
| 1.994911335029533 | 0.412 | 0.331 | -0.319 |
| 1.998052927683123 | 0.414 | 0.328 | -0.32 |
| 2.001194520336712 | 0.417 | 0.326 | -0.32 |
| 2.004336112990302 | 0.42 | 0.324 | -0.321 |
| 2.007477705643892 | 0.423 | 0.321 | -0.322 |
| 2.010619298297482 | 0.426 | 0.319 | -0.323 |
| 2.013760890951071 | 0.429 | 0.316 | -0.324 |
| 2.016902483604661 | 0.431 | 0.314 | -0.324 |
| 2.02004407625825 | 0.434 | 0.311 | -0.325 |
| 2.02318566891184 | 0.437 | 0.309 | -0.326 |
| 2.02632726156543 | 0.44 | 0.306 | -0.326 |
| 2.029468854219019 | 0.443 | 0.304 | -0.327 |
| 2.032610446872609 | 0.446 | 0.301 | -0.328 |
| 2.035752039526198 | 0.448 | 0.299 | -0.328 |
| 2.038893632179788 | 0.451 | 0.296 | -0.329 |
| 2.042035224833378 | 0.454 | 0.294 | -0.329 |
| 2.045176817486967 | 0.457 | 0.291 | -0.33 |
| 2.048318410140557 | 0.46 | 0.289 | -0.33 |
| 2.051460002794146 | 0.462 | 0.286 | -0.331 |
| 2.054601595447736 | 0.465 | 0.284 | -0.331 |
| 2.057743188101325 | 0.468 | 0.281 | -0.331 |
| 2.060884780754915 | 0.471 | 0.278 | -0.332 |
| 2.064026373408505 | 0.473 | 0.276 | -0.332 |
| 2.067167966062094 | 0.476 | 0.273 | -0.332 |
| 2.070309558715684 | 0.479 | 0.271 | -0.332 |
| 2.073451151369273 | 0.482 | 0.268 | -0.333 |
| 2.076592744022863 | 0.485 | 0.265 | -0.333 |
| 2.079734336676452 | 0.487 | 0.263 | -0.333 |
| 2.082875929330042 | 0.49 | 0.26 | -0.333 |
| 2.086017521983632 | 0.493 | 0.257 | -0.333 |
| 2.089159114637221 | 0.495 | 0.255 | -0.333 |
| 2.092300707290811 | 0.498 | 0.252 | -0.333 |
| 2.095442299944401 | 0.501 | 0.249 | -0.333 |
| 2.09858389259799 | 0.504 | 0.246 | -0.333 |
| 2.10172548525158 | 0.506 | 0.244 | -0.333 |
| 2.104867077905169 | 0.509 | 0.241 | -0.333 |
| 2.108008670558759 | 0.512 | 0.238 | -0.333 |
| 2.111150263212349 | 0.514 | 0.235 | -0.333 |
| 2.114291855865938 | 0.517 | 0.233 | -0.333 |
| 2.117433448519528 | 0.52 | 0.23 | -0.333 |
| 2.120575041173117 | 0.522 | 0.227 | -0.332 |
| 2.123716633826707 | 0.525 | 0.224 | -0.332 |
| 2.126858226480297 | 0.528 | 0.221 | -0.332 |
| 2.129999819133886 | 0.531 | 0.219 | -0.331 |
| 2.133141411787476 | 0.533 | 0.216 | -0.331 |
| 2.136283004441065 | 0.536 | 0.213 | -0.331 |
| 2.139424597094655 | 0.538 | 0.21 | -0.33 |
| 2.142566189748245 | 0.541 | 0.207 | -0.33 |
| 2.145707782401834 | 0.544 | 0.204 | -0.329 |
| 2.148849375055424 | 0.546 | 0.201 | -0.329 |
| 2.151990967709013 | 0.549 | 0.199 | -0.328 |
| 2.155132560362603 | 0.552 | 0.196 | -0.328 |
| 2.158274153016193 | 0.554 | 0.193 | -0.327 |
| 2.161415745669782 | 0.557 | 0.19 | -0.327 |
| 2.164557338323372 | 0.559 | 0.187 | -0.326 |
| 2.167698930976961 | 0.562 | 0.184 | -0.325 |
| 2.170840523630551 | 0.565 | 0.181 | -0.325 |
| 2.173982116284141 | 0.567 | 0.178 | -0.324 |
| 2.17712370893773 | 0.57 | 0.175 | -0.323 |
| 2.18026530159132 | 0.572 | 0.172 | -0.322 |
| 2.183406894244909 | 0.575 | 0.169 | -0.322 |
| 2.186548486898499 | 0.578 | 0.166 | -0.321 |
| 2.189690079552089 | 0.58 | 0.163 | -0.32 |
| 2.192831672205678 | 0.583 | 0.16 | -0.319 |
| 2.195973264859268 | 0.585 | 0.157 | -0.318 |
| 2.199114857512857 | 0.588 | 0.155 | -0.317 |
| 2.202256450166447 | 0.59 | 0.152 | -0.316 |
| 2.205398042820036 | 0.593 | 0.149 | -0.315 |
| 2.208539635473626 | 0.595 | 0.146 | -0.314 |
| 2.211681228127216 | 0.598 | 0.143 | -0.313 |
| 2.214822820780805 | 0.6 | 0.139 | -0.312 |
| 2.217964413434395 | 0.603 | 0.136 | -0.311 |
| 2.221106006087984 | 0.605 | 0.133 | -0.31 |
| 2.224247598741574 | 0.608 | 0.13 | -0.308 |
| 2.227389191395164 | 0.61 | 0.127 | -0.307 |
| 2.230530784048753 | 0.613 | 0.124 | -0.306 |
| 2.233672376702343 | 0.615 | 0.121 | -0.305 |
| 2.236813969355933 | 0.618 | 0.118 | -0.303 |
| 2.239955562009522 | 0.62 | 0.115 | -0.302 |
| 2.243097154663112 | 0.623 | 0.112 | -0.301 |
| 2.246238747316701 | 0.625 | 0.109 | -0.299 |
| 2.249380339970291 | 0.628 | 0.106 | -0.298 |
| 2.252521932623881 | 0.63 | 0.103 | -0.297 |
| 2.25566352527747 | 0.633 | 0.1 | -0.295 |
| 2.25880511793106 | 0.635 | 0.097 | -0.294 |
| 2.261946710584649 | 0.637 | 0.094 | -0.292 |
| 2.265088303238239 | 0.64 | 0.091 | -0.291 |
| 2.268229895891829 | 0.642 | 0.088 | -0.289 |
| 2.271371488545418 | 0.645 | 0.084 | -0.287 |
| 2.274513081199008 | 0.647 | 0.081 | -0.286 |
| 2.277654673852597 | 0.649 | 0.078 | -0.284 |
| 2.280796266506186 | 0.652 | 0.075 | -0.283 |
| 2.283937859159776 | 0.654 | 0.072 | -0.281 |
| 2.287079451813366 | 0.657 | 0.069 | -0.279 |
| 2.290221044466955 | 0.659 | 0.066 | -0.277 |
| 2.293362637120545 | 0.661 | 0.063 | -0.276 |
| 2.296504229774135 | 0.664 | 0.06 | -0.274 |
| 2.299645822427724 | 0.666 | 0.056 | -0.272 |
| 2.302787415081314 | 0.668 | 0.053 | -0.27 |
| 2.305929007734904 | 0.671 | 0.05 | -0.268 |
| 2.309070600388493 | 0.673 | 0.047 | -0.267 |
| 2.312212193042083 | 0.675 | 0.044 | -0.265 |
| 2.315353785695672 | 0.678 | 0.041 | -0.263 |
| 2.318495378349262 | 0.68 | 0.038 | -0.261 |
| 2.321636971002852 | 0.682 | 0.035 | -0.259 |
| 2.324778563656441 | 0.685 | 0.031 | -0.257 |
| 2.327920156310031 | 0.687 | 0.028 | -0.255 |
| 2.33106174896362 | 0.689 | 0.025 | -0.253 |
| 2.33420334161721 | 0.691 | 0.022 | -0.251 |
| 2.3373449342708 | 0.694 | 0.019 | -0.249 |
| 2.340486526924389 | 0.696 | 0.016 | -0.247 |
| 2.343628119577979 | 0.698 | 0.013 | -0.244 |
| 2.346769712231568 | 0.7 | 0.009 | -0.242 |
| 2.349911304885158 | 0.703 | 0.006 | -0.24 |
| 2.353052897538748 | 0.705 | 0.003 | -0.238 |
| 2.356194490192337 | 0.707 | 0 | -0.236 |
| 2.359336082845927 | 0.709 | -0.003 | -0.233 |
| 2.362477675499516 | 0.712 | -0.006 | -0.231 |
| 2.365619268153106 | 0.714 | -0.009 | -0.229 |
| 2.368760860806696 | 0.716 | -0.013 | -0.227 |
| 2.371902453460285 | 0.718 | -0.016 | -0.224 |
| 2.375044046113875 | 0.72 | -0.019 | -0.222 |
| 2.378185638767464 | 0.722 | -0.022 | -0.22 |
| 2.381327231421054 | 0.725 | -0.025 | -0.217 |
| 2.384468824074644 | 0.727 | -0.028 | -0.215 |
| 2.387610416728233 | 0.729 | -0.031 | -0.212 |
| 2.390752009381823 | 0.731 | -0.035 | -0.21 |
| 2.393893602035412 | 0.733 | -0.038 | -0.208 |
| 2.397035194689002 | 0.735 | -0.041 | -0.205 |
| 2.400176787342591 | 0.738 | -0.044 | -0.203 |
| 2.403318379996181 | 0.74 | -0.047 | -0.2 |
| 2.406459972649771 | 0.742 | -0.05 | -0.198 |
| 2.40960156530336 | 0.744 | -0.053 | -0.195 |
| 2.41274315795695 | 0.746 | -0.056 | -0.193 |
| 2.41588475061054 | 0.748 | -0.06 | -0.19 |
| 2.419026343264129 | 0.75 | -0.063 | -0.187 |
| 2.422167935917719 | 0.752 | -0.066 | -0.185 |
| 2.425309528571308 | 0.754 | -0.069 | -0.182 |
| 2.428451121224898 | 0.756 | -0.072 | -0.179 |
| 2.431592713878488 | 0.758 | -0.075 | -0.177 |
| 2.434734306532077 | 0.76 | -0.078 | -0.174 |
| 2.437875899185667 | 0.762 | -0.081 | -0.171 |
| 2.441017491839256 | 0.764 | -0.084 | -0.169 |
| 2.444159084492846 | 0.766 | -0.088 | -0.166 |
| 2.447300677146435 | 0.769 | -0.091 | -0.163 |
| 2.450442269800025 | 0.771 | -0.094 | -0.161 |
| 2.453583862453615 | 0.773 | -0.097 | -0.158 |
| 2.456725455107204 | 0.775 | -0.1 | -0.155 |
| 2.459867047760794 | 0.776 | -0.103 | -0.152 |
| 2.463008640414384 | 0.778 | -0.106 | -0.149 |
| 2.466150233067973 | 0.78 | -0.109 | -0.147 |
| 2.469291825721563 | 0.782 | -0.112 | -0.144 |
| 2.472433418375152 | 0.784 | -0.115 | -0.141 |
| 2.475575011028742 | 0.786 | -0.118 | -0.138 |
| 2.478716603682332 | 0.788 | -0.121 | -0.135 |
| 2.481858196335921 | 0.79 | -0.124 | -0.132 |
| 2.48499978898951 | 0.792 | -0.127 | -0.129 |
| 2.4881413816431 | 0.794 | -0.13 | -0.127 |
| 2.49128297429669 | 0.796 | -0.133 | -0.124 |
| 2.49442456695028 | 0.798 | -0.136 | -0.121 |
| 2.497566159603869 | 0.8 | -0.139 | -0.118 |
| 2.500707752257458 | 0.802 | -0.143 | -0.115 |
| 2.503849344911048 | 0.803 | -0.146 | -0.112 |
| 2.506990937564638 | 0.805 | -0.149 | -0.109 |
| 2.510132530218228 | 0.807 | -0.152 | -0.106 |
| 2.513274122871817 | 0.809 | -0.155 | -0.103 |
| 2.516415715525407 | 0.811 | -0.157 | -0.1 |
| 2.519557308178996 | 0.813 | -0.16 | -0.097 |
| 2.522698900832586 | 0.815 | -0.163 | -0.094 |
| 2.525840493486176 | 0.816 | -0.166 | -0.091 |
| 2.528982086139765 | 0.818 | -0.169 | -0.088 |
| 2.532123678793355 | 0.82 | -0.172 | -0.085 |
| 2.535265271446944 | 0.822 | -0.175 | -0.082 |
| 2.538406864100534 | 0.824 | -0.178 | -0.079 |
| 2.541548456754124 | 0.825 | -0.181 | -0.076 |
| 2.544690049407713 | 0.827 | -0.184 | -0.073 |
| 2.547831642061302 | 0.829 | -0.187 | -0.07 |
| 2.550973234714892 | 0.831 | -0.19 | -0.067 |
| 2.554114827368482 | 0.832 | -0.193 | -0.063 |
| 2.557256420022072 | 0.834 | -0.196 | -0.06 |
| 2.560398012675661 | 0.836 | -0.199 | -0.057 |
| 2.563539605329251 | 0.838 | -0.201 | -0.054 |
| 2.56668119798284 | 0.839 | -0.204 | -0.051 |
| 2.56982279063643 | 0.841 | -0.207 | -0.048 |
| 2.57296438329002 | 0.843 | -0.21 | -0.045 |
| 2.576105975943609 | 0.844 | -0.213 | -0.042 |
| 2.579247568597199 | 0.846 | -0.216 | -0.039 |
| 2.582389161250788 | 0.848 | -0.219 | -0.036 |
| 2.585530753904377 | 0.849 | -0.221 | -0.032 |
| 2.588672346557967 | 0.851 | -0.224 | -0.029 |
| 2.591813939211557 | 0.853 | -0.227 | -0.026 |
| 2.594955531865147 | 0.854 | -0.23 | -0.023 |
| 2.598097124518736 | 0.856 | -0.233 | -0.02 |
| 2.601238717172326 | 0.858 | -0.235 | -0.017 |
| 2.604380309825915 | 0.859 | -0.238 | -0.014 |
| 2.607521902479505 | 0.861 | -0.241 | -0.01 |
| 2.610663495133095 | 0.862 | -0.244 | -0.007 |
| 2.613805087786684 | 0.864 | -0.246 | -0.004 |
| 2.616946680440274 | 0.866 | -0.249 | -0.001 |
| 2.620088273093863 | 0.867 | -0.252 | 0.002 |
| 2.623229865747452 | 0.869 | -0.255 | 0.005 |
| 2.626371458401042 | 0.87 | -0.257 | 0.008 |
| 2.629513051054632 | 0.872 | -0.26 | 0.012 |
| 2.632654643708222 | 0.873 | -0.263 | 0.015 |
| 2.635796236361811 | 0.875 | -0.265 | 0.018 |
| 2.638937829015401 | 0.876 | -0.268 | 0.021 |
| 2.642079421668991 | 0.878 | -0.271 | 0.024 |
| 2.64522101432258 | 0.879 | -0.273 | 0.027 |
| 2.64836260697617 | 0.881 | -0.276 | 0.03 |
| 2.651504199629759 | 0.882 | -0.278 | 0.033 |
| 2.654645792283349 | 0.884 | -0.281 | 0.037 |
| 2.657787384936938 | 0.885 | -0.284 | 0.04 |
| 2.660928977590528 | 0.887 | -0.286 | 0.043 |
| 2.664070570244118 | 0.888 | -0.289 | 0.046 |
| 2.667212162897707 | 0.89 | -0.291 | 0.049 |
| 2.670353755551297 | 0.891 | -0.294 | 0.052 |
| 2.673495348204887 | 0.892 | -0.296 | 0.055 |
| 2.676636940858476 | 0.894 | -0.299 | 0.058 |
| 2.679778533512066 | 0.895 | -0.301 | 0.061 |
| 2.682920126165655 | 0.897 | -0.304 | 0.065 |
| 2.686061718819245 | 0.898 | -0.306 | 0.068 |
| 2.689203311472835 | 0.899 | -0.309 | 0.071 |
| 2.692344904126424 | 0.901 | -0.311 | 0.074 |
| 2.695486496780014 | 0.902 | -0.314 | 0.077 |
| 2.698628089433603 | 0.903 | -0.316 | 0.08 |
| 2.701769682087193 | 0.905 | -0.319 | 0.083 |
| 2.704911274740782 | 0.906 | -0.321 | 0.086 |
| 2.708052867394372 | 0.907 | -0.324 | 0.089 |
| 2.711194460047962 | 0.909 | -0.326 | 0.092 |
| 2.714336052701551 | 0.91 | -0.328 | 0.095 |
| 2.717477645355141 | 0.911 | -0.331 | 0.098 |
| 2.720619238008731 | 0.913 | -0.333 | 0.101 |
| 2.72376083066232 | 0.914 | -0.335 | 0.104 |
| 2.72690242331591 | 0.915 | -0.338 | 0.107 |
| 2.730044015969499 | 0.917 | -0.34 | 0.11 |
| 2.733185608623089 | 0.918 | -0.342 | 0.113 |
| 2.736327201276678 | 0.919 | -0.345 | 0.116 |
| 2.739468793930268 | 0.92 | -0.347 | 0.119 |
| 2.742610386583858 | 0.921 | -0.349 | 0.122 |
| 2.745751979237447 | 0.923 | -0.351 | 0.125 |
| 2.748893571891036 | 0.924 | -0.354 | 0.128 |
| 2.752035164544627 | 0.925 | -0.356 | 0.13 |
| 2.755176757198216 | 0.926 | -0.358 | 0.133 |
| 2.758318349851806 | 0.927 | -0.36 | 0.136 |
| 2.761459942505395 | 0.929 | -0.362 | 0.139 |
| 2.764601535158985 | 0.93 | -0.364 | 0.142 |
| 2.767743127812574 | 0.931 | -0.367 | 0.145 |
| 2.770884720466164 | 0.932 | -0.369 | 0.148 |
| 2.774026313119754 | 0.933 | -0.371 | 0.15 |
| 2.777167905773343 | 0.934 | -0.373 | 0.153 |
| 2.780309498426932 | 0.935 | -0.375 | 0.156 |
| 2.783451091080522 | 0.937 | -0.377 | 0.159 |
| 2.786592683734112 | 0.938 | -0.379 | 0.162 |
| 2.789734276387701 | 0.939 | -0.381 | 0.164 |
| 2.792875869041291 | 0.94 | -0.383 | 0.167 |
| 2.796017461694881 | 0.941 | -0.385 | 0.17 |
| 2.79915905434847 | 0.942 | -0.387 | 0.172 |
| 2.80230064700206 | 0.943 | -0.389 | 0.175 |
| 2.80544223965565 | 0.944 | -0.391 | 0.178 |
| 2.808583832309239 | 0.945 | -0.393 | 0.18 |
| 2.811725424962829 | 0.946 | -0.395 | 0.183 |
| 2.814867017616419 | 0.947 | -0.397 | 0.186 |
| 2.818008610270008 | 0.948 | -0.399 | 0.188 |
| 2.821150202923598 | 0.949 | -0.401 | 0.191 |
| 2.824291795577187 | 0.95 | -0.403 | 0.193 |
| 2.827433388230777 | 0.951 | -0.405 | 0.196 |
| 2.830574980884366 | 0.952 | -0.406 | 0.198 |
| 2.833716573537956 | 0.953 | -0.408 | 0.201 |
| 2.836858166191546 | 0.954 | -0.41 | 0.203 |
| 2.839999758845135 | 0.955 | -0.412 | 0.206 |
| 2.843141351498725 | 0.956 | -0.414 | 0.208 |
| 2.846282944152314 | 0.957 | -0.415 | 0.211 |
| 2.849424536805904 | 0.958 | -0.417 | 0.213 |
| 2.852566129459494 | 0.959 | -0.419 | 0.216 |
| 2.855707722113083 | 0.959 | -0.42 | 0.218 |
| 2.858849314766673 | 0.96 | -0.422 | 0.22 |
| 2.861990907420262 | 0.961 | -0.424 | 0.223 |
| 2.865132500073852 | 0.962 | -0.425 | 0.225 |
| 2.868274092727442 | 0.963 | -0.427 | 0.227 |
| 2.871415685381031 | 0.964 | -0.429 | 0.23 |
| 2.874557278034621 | 0.965 | -0.43 | 0.232 |
| 2.87769887068821 | 0.965 | -0.432 | 0.234 |
| 2.8808404633418 | 0.966 | -0.434 | 0.236 |
| 2.88398205599539 | 0.967 | -0.435 | 0.239 |
| 2.88712364864898 | 0.968 | -0.437 | 0.241 |
| 2.890265241302569 | 0.969 | -0.438 | 0.243 |
| 2.893406833956158 | 0.969 | -0.44 | 0.245 |
| 2.896548426609748 | 0.97 | -0.441 | 0.247 |
| 2.899690019263338 | 0.971 | -0.443 | 0.249 |
| 2.902831611916927 | 0.972 | -0.444 | 0.251 |
| 2.905973204570517 | 0.972 | -0.446 | 0.253 |
| 2.909114797224106 | 0.973 | -0.447 | 0.255 |
| 2.912256389877696 | 0.974 | -0.448 | 0.258 |
| 2.915397982531286 | 0.975 | -0.45 | 0.259 |
| 2.918539575184875 | 0.975 | -0.451 | 0.261 |
| 2.921681167838465 | 0.976 | -0.452 | 0.263 |
| 2.924822760492054 | 0.977 | -0.454 | 0.265 |
| 2.927964353145644 | 0.977 | -0.455 | 0.267 |
| 2.931105945799234 | 0.978 | -0.456 | 0.269 |
| 2.934247538452823 | 0.979 | -0.458 | 0.271 |
| 2.937389131106413 | 0.979 | -0.459 | 0.273 |
| 2.940530723760002 | 0.98 | -0.46 | 0.275 |
| 2.943672316413592 | 0.98 | -0.461 | 0.276 |
| 2.946813909067182 | 0.981 | -0.463 | 0.278 |
| 2.949955501720771 | 0.982 | -0.464 | 0.28 |
| 2.953097094374361 | 0.982 | -0.465 | 0.281 |
| 2.95623868702795 | 0.983 | -0.466 | 0.283 |
| 2.95938027968154 | 0.983 | -0.467 | 0.285 |
| 2.96252187233513 | 0.984 | -0.468 | 0.286 |
| 2.965663464988719 | 0.985 | -0.469 | 0.288 |
| 2.968805057642309 | 0.985 | -0.47 | 0.29 |
| 2.971946650295898 | 0.986 | -0.471 | 0.291 |
| 2.975088242949488 | 0.986 | -0.473 | 0.293 |
| 2.978229835603078 | 0.987 | -0.474 | 0.294 |
| 2.981371428256667 | 0.987 | -0.475 | 0.296 |
| 2.984513020910257 | 0.988 | -0.476 | 0.297 |
| 2.987654613563846 | 0.988 | -0.476 | 0.298 |
| 2.990796206217436 | 0.989 | -0.477 | 0.3 |
| 2.993937798871025 | 0.989 | -0.478 | 0.301 |
| 2.997079391524615 | 0.99 | -0.479 | 0.302 |
| 3.000220984178205 | 0.99 | -0.48 | 0.304 |
| 3.003362576831794 | 0.99 | -0.481 | 0.305 |
| 3.006504169485384 | 0.991 | -0.482 | 0.306 |
| 3.009645762138974 | 0.991 | -0.483 | 0.308 |
| 3.012787354792563 | 0.992 | -0.484 | 0.309 |
| 3.015928947446153 | 0.992 | -0.484 | 0.31 |
| 3.019070540099742 | 0.993 | -0.485 | 0.311 |
| 3.022212132753332 | 0.993 | -0.486 | 0.312 |
| 3.025353725406922 | 0.993 | -0.487 | 0.313 |
| 3.028495318060511 | 0.994 | -0.487 | 0.314 |
| 3.031636910714101 | 0.994 | -0.488 | 0.315 |
| 3.03477850336769 | 0.994 | -0.489 | 0.316 |
| 3.03792009602128 | 0.995 | -0.489 | 0.317 |
| 3.04106168867487 | 0.995 | -0.49 | 0.318 |
| 3.04420328132846 | 0.995 | -0.491 | 0.319 |
| 3.047344873982049 | 0.996 | -0.491 | 0.32 |
| 3.050486466635638 | 0.996 | -0.492 | 0.321 |
| 3.053628059289228 | 0.996 | -0.492 | 0.322 |
| 3.056769651942818 | 0.996 | -0.493 | 0.323 |
| 3.059911244596407 | 0.997 | -0.493 | 0.323 |
| 3.063052837249997 | 0.997 | -0.494 | 0.324 |
| 3.066194429903586 | 0.997 | -0.494 | 0.325 |
| 3.069336022557176 | 0.997 | -0.495 | 0.326 |
| 3.072477615210766 | 0.998 | -0.495 | 0.326 |
| 3.075619207864355 | 0.998 | -0.496 | 0.327 |
| 3.078760800517945 | 0.998 | -0.496 | 0.327 |
| 3.081902393171534 | 0.998 | -0.496 | 0.328 |
| 3.085043985825124 | 0.998 | -0.497 | 0.329 |
| 3.088185578478713 | 0.999 | -0.497 | 0.329 |
| 3.091327171132303 | 0.999 | -0.497 | 0.33 |
| 3.094468763785893 | 0.999 | -0.498 | 0.33 |
| 3.097610356439482 | 0.999 | -0.498 | 0.33 |
| 3.100751949093072 | 0.999 | -0.498 | 0.331 |
| 3.103893541746661 | 0.999 | -0.499 | 0.331 |
| 3.107035134400251 | 0.999 | -0.499 | 0.332 |
| 3.110176727053841 | 1 | -0.499 | 0.332 |
| 3.11331831970743 | 1 | -0.499 | 0.332 |
| 3.11645991236102 | 1 | -0.499 | 0.332 |
| 3.11960150501461 | 1 | -0.5 | 0.333 |
| 3.122743097668199 | 1 | -0.5 | 0.333 |
| 3.125884690321789 | 1 | -0.5 | 0.333 |
| 3.129026282975378 | 1 | -0.5 | 0.333 |
| 3.132167875628968 | 1 | -0.5 | 0.333 |
| 3.135309468282557 | 1 | -0.5 | 0.333 |
| 3.138451060936147 | 1 | -0.5 | 0.333 |
| 3.141592653589737 | 1 | -0.5 | 0.333 |
| 3.144734246243326 | 1 | -0.5 | 0.333 |
| 3.147875838896916 | 1 | -0.5 | 0.333 |
| 3.151017431550505 | 1 | -0.5 | 0.333 |
| 3.154159024204095 | 1 | -0.5 | 0.333 |
| 3.157300616857685 | 1 | -0.5 | 0.333 |
| 3.160442209511274 | 1 | -0.5 | 0.333 |
| 3.163583802164864 | 1 | -0.5 | 0.333 |
| 3.166725394818453 | 1 | -0.499 | 0.332 |
| 3.169866987472043 | 1 | -0.499 | 0.332 |
| 3.173008580125633 | 1 | -0.499 | 0.332 |
| 3.176150172779222 | 0.999 | -0.499 | 0.332 |
| 3.179291765432812 | 0.999 | -0.499 | 0.331 |
| 3.182433358086401 | 0.999 | -0.498 | 0.331 |
| 3.185574950739991 | 0.999 | -0.498 | 0.33 |
| 3.188716543393581 | 0.999 | -0.498 | 0.33 |
| 3.19185813604717 | 0.999 | -0.497 | 0.33 |
| 3.19499972870076 | 0.999 | -0.497 | 0.329 |
| 3.198141321354349 | 0.998 | -0.497 | 0.329 |
| 3.20128291400794 | 0.998 | -0.496 | 0.328 |
| 3.204424506661528 | 0.998 | -0.496 | 0.327 |
| 3.207566099315118 | 0.998 | -0.496 | 0.327 |
| 3.210707691968708 | 0.998 | -0.495 | 0.326 |
| 3.213849284622297 | 0.997 | -0.495 | 0.326 |
| 3.216990877275887 | 0.997 | -0.494 | 0.325 |
| 3.220132469929476 | 0.997 | -0.494 | 0.324 |
| 3.223274062583066 | 0.997 | -0.493 | 0.323 |
| 3.226415655236656 | 0.996 | -0.493 | 0.323 |
| 3.229557247890245 | 0.996 | -0.492 | 0.322 |
| 3.232698840543835 | 0.996 | -0.492 | 0.321 |
| 3.235840433197425 | 0.996 | -0.491 | 0.32 |
| 3.238982025851014 | 0.995 | -0.491 | 0.319 |
| 3.242123618504604 | 0.995 | -0.49 | 0.318 |
| 3.245265211158193 | 0.995 | -0.489 | 0.317 |
| 3.248406803811783 | 0.994 | -0.489 | 0.316 |
| 3.251548396465373 | 0.994 | -0.488 | 0.315 |
| 3.254689989118962 | 0.994 | -0.487 | 0.314 |
| 3.257831581772551 | 0.993 | -0.487 | 0.313 |
| 3.260973174426141 | 0.993 | -0.486 | 0.312 |
| 3.26411476707973 | 0.993 | -0.485 | 0.311 |
| 3.267256359733321 | 0.992 | -0.484 | 0.31 |
| 3.27039795238691 | 0.992 | -0.484 | 0.309 |
| 3.2735395450405 | 0.991 | -0.483 | 0.308 |
| 3.276681137694089 | 0.991 | -0.482 | 0.306 |
| 3.279822730347679 | 0.99 | -0.481 | 0.305 |
| 3.282964323001269 | 0.99 | -0.48 | 0.304 |
| 3.286105915654858 | 0.99 | -0.479 | 0.302 |
| 3.289247508308448 | 0.989 | -0.478 | 0.301 |
| 3.292389100962037 | 0.989 | -0.477 | 0.3 |
| 3.295530693615627 | 0.988 | -0.476 | 0.298 |
| 3.298672286269217 | 0.988 | -0.476 | 0.297 |
| 3.301813878922806 | 0.987 | -0.475 | 0.296 |
| 3.304955471576396 | 0.987 | -0.474 | 0.294 |
| 3.308097064229985 | 0.986 | -0.473 | 0.293 |
| 3.311238656883575 | 0.986 | -0.471 | 0.291 |
| 3.314380249537165 | 0.985 | -0.47 | 0.29 |
| 3.317521842190754 | 0.985 | -0.469 | 0.288 |
| 3.320663434844344 | 0.984 | -0.468 | 0.286 |
| 3.323805027497933 | 0.983 | -0.467 | 0.285 |
| 3.326946620151523 | 0.983 | -0.466 | 0.283 |
| 3.330088212805113 | 0.982 | -0.465 | 0.281 |
| 3.333229805458702 | 0.982 | -0.464 | 0.28 |
| 3.336371398112292 | 0.981 | -0.463 | 0.278 |
| 3.339512990765881 | 0.98 | -0.461 | 0.276 |
| 3.342654583419471 | 0.98 | -0.46 | 0.275 |
| 3.345796176073061 | 0.979 | -0.459 | 0.273 |
| 3.34893776872665 | 0.979 | -0.458 | 0.271 |
| 3.35207936138024 | 0.978 | -0.456 | 0.269 |
| 3.355220954033829 | 0.977 | -0.455 | 0.267 |
| 3.358362546687419 | 0.977 | -0.454 | 0.265 |
| 3.361504139341009 | 0.976 | -0.452 | 0.263 |
| 3.364645731994598 | 0.975 | -0.451 | 0.261 |
| 3.367787324648188 | 0.975 | -0.45 | 0.259 |
| 3.370928917301777 | 0.974 | -0.448 | 0.258 |
| 3.374070509955367 | 0.973 | -0.447 | 0.255 |
| 3.377212102608956 | 0.972 | -0.446 | 0.253 |
| 3.380353695262546 | 0.972 | -0.444 | 0.251 |
| 3.383495287916136 | 0.971 | -0.443 | 0.249 |
| 3.386636880569725 | 0.97 | -0.441 | 0.247 |
| 3.389778473223315 | 0.969 | -0.44 | 0.245 |
| 3.392920065876904 | 0.969 | -0.438 | 0.243 |
| 3.396061658530494 | 0.968 | -0.437 | 0.241 |
| 3.399203251184084 | 0.967 | -0.435 | 0.239 |
| 3.402344843837673 | 0.966 | -0.434 | 0.236 |
| 3.405486436491263 | 0.965 | -0.432 | 0.234 |
| 3.408628029144852 | 0.965 | -0.43 | 0.232 |
| 3.411769621798442 | 0.964 | -0.429 | 0.23 |
| 3.414911214452032 | 0.963 | -0.427 | 0.227 |
| 3.418052807105621 | 0.962 | -0.425 | 0.225 |
| 3.421194399759211 | 0.961 | -0.424 | 0.223 |
| 3.4243359924128 | 0.96 | -0.422 | 0.22 |
| 3.42747758506639 | 0.959 | -0.42 | 0.218 |
| 3.43061917771998 | 0.959 | -0.419 | 0.216 |
| 3.433760770373569 | 0.958 | -0.417 | 0.213 |
| 3.436902363027159 | 0.957 | -0.415 | 0.211 |
| 3.440043955680748 | 0.956 | -0.414 | 0.208 |
| 3.443185548334338 | 0.955 | -0.412 | 0.206 |
| 3.446327140987927 | 0.954 | -0.41 | 0.203 |
| 3.449468733641517 | 0.953 | -0.408 | 0.201 |
| 3.452610326295107 | 0.952 | -0.406 | 0.198 |
| 3.455751918948696 | 0.951 | -0.405 | 0.196 |
| 3.458893511602286 | 0.95 | -0.403 | 0.193 |
| 3.462035104255876 | 0.949 | -0.401 | 0.191 |
| 3.465176696909465 | 0.948 | -0.399 | 0.188 |
| 3.468318289563055 | 0.947 | -0.397 | 0.186 |
| 3.471459882216644 | 0.946 | -0.395 | 0.183 |
| 3.474601474870234 | 0.945 | -0.393 | 0.18 |
| 3.477743067523824 | 0.944 | -0.391 | 0.178 |
| 3.480884660177413 | 0.943 | -0.389 | 0.175 |
| 3.484026252831002 | 0.942 | -0.387 | 0.172 |
| 3.487167845484592 | 0.941 | -0.385 | 0.17 |
| 3.490309438138182 | 0.94 | -0.383 | 0.167 |
| 3.493451030791772 | 0.939 | -0.381 | 0.164 |
| 3.496592623445361 | 0.938 | -0.379 | 0.162 |
| 3.499734216098951 | 0.937 | -0.377 | 0.159 |
| 3.50287580875254 | 0.935 | -0.375 | 0.156 |
| 3.50601740140613 | 0.934 | -0.373 | 0.153 |
| 3.50915899405972 | 0.933 | -0.371 | 0.15 |
| 3.512300586713309 | 0.932 | -0.369 | 0.148 |
| 3.515442179366899 | 0.931 | -0.367 | 0.145 |
| 3.518583772020488 | 0.93 | -0.364 | 0.142 |
| 3.521725364674078 | 0.929 | -0.362 | 0.139 |
| 3.524866957327668 | 0.927 | -0.36 | 0.136 |
| 3.528008549981257 | 0.926 | -0.358 | 0.133 |
| 3.531150142634847 | 0.925 | -0.356 | 0.13 |
| 3.534291735288436 | 0.924 | -0.354 | 0.128 |
| 3.537433327942026 | 0.923 | -0.351 | 0.125 |
| 3.540574920595616 | 0.921 | -0.349 | 0.122 |
| 3.543716513249205 | 0.92 | -0.347 | 0.119 |
| 3.546858105902795 | 0.919 | -0.345 | 0.116 |
| 3.549999698556384 | 0.918 | -0.342 | 0.113 |
| 3.553141291209974 | 0.917 | -0.34 | 0.11 |
| 3.556282883863564 | 0.915 | -0.338 | 0.107 |
| 3.559424476517153 | 0.914 | -0.335 | 0.104 |
| 3.562566069170743 | 0.913 | -0.333 | 0.101 |
| 3.565707661824332 | 0.911 | -0.331 | 0.098 |
| 3.568849254477922 | 0.91 | -0.328 | 0.095 |
| 3.571990847131511 | 0.909 | -0.326 | 0.092 |
| 3.575132439785101 | 0.907 | -0.324 | 0.089 |
| 3.578274032438691 | 0.906 | -0.321 | 0.086 |
| 3.58141562509228 | 0.905 | -0.319 | 0.083 |
| 3.58455721774587 | 0.903 | -0.316 | 0.08 |
| 3.58769881039946 | 0.902 | -0.314 | 0.077 |
| 3.590840403053049 | 0.901 | -0.311 | 0.074 |
| 3.593981995706639 | 0.899 | -0.309 | 0.071 |
| 3.597123588360228 | 0.898 | -0.306 | 0.068 |
| 3.600265181013818 | 0.897 | -0.304 | 0.065 |
| 3.603406773667407 | 0.895 | -0.301 | 0.061 |
| 3.606548366320997 | 0.894 | -0.299 | 0.058 |
| 3.609689958974587 | 0.892 | -0.296 | 0.055 |
| 3.612831551628176 | 0.891 | -0.294 | 0.052 |
| 3.615973144281766 | 0.89 | -0.291 | 0.049 |
| 3.619114736935355 | 0.888 | -0.289 | 0.046 |
| 3.622256329588945 | 0.887 | -0.286 | 0.043 |
| 3.625397922242534 | 0.885 | -0.284 | 0.04 |
| 3.628539514896124 | 0.884 | -0.281 | 0.037 |
| 3.631681107549714 | 0.882 | -0.278 | 0.033 |
| 3.634822700203303 | 0.881 | -0.276 | 0.03 |
| 3.637964292856893 | 0.879 | -0.273 | 0.027 |
| 3.641105885510483 | 0.878 | -0.271 | 0.024 |
| 3.644247478164072 | 0.876 | -0.268 | 0.021 |
| 3.647389070817662 | 0.875 | -0.265 | 0.018 |
| 3.650530663471251 | 0.873 | -0.263 | 0.015 |
| 3.653672256124841 | 0.872 | -0.26 | 0.012 |
| 3.656813848778431 | 0.87 | -0.257 | 0.008 |
| 3.65995544143202 | 0.869 | -0.255 | 0.005 |
| 3.66309703408561 | 0.867 | -0.252 | 0.002 |
| 3.666238626739199 | 0.866 | -0.249 | -0.001 |
| 3.66938021939279 | 0.864 | -0.246 | -0.004 |
| 3.672521812046378 | 0.862 | -0.244 | -0.007 |
| 3.675663404699968 | 0.861 | -0.241 | -0.01 |
| 3.678804997353558 | 0.859 | -0.238 | -0.014 |
| 3.681946590007147 | 0.858 | -0.235 | -0.017 |
| 3.685088182660737 | 0.856 | -0.233 | -0.02 |
| 3.688229775314326 | 0.854 | -0.23 | -0.023 |
| 3.691371367967916 | 0.853 | -0.227 | -0.026 |
| 3.694512960621506 | 0.851 | -0.224 | -0.029 |
| 3.697654553275095 | 0.849 | -0.221 | -0.032 |
| 3.700796145928685 | 0.848 | -0.219 | -0.036 |
| 3.703937738582274 | 0.846 | -0.216 | -0.039 |
| 3.707079331235864 | 0.844 | -0.213 | -0.042 |
| 3.710220923889454 | 0.843 | -0.21 | -0.045 |
| 3.713362516543043 | 0.841 | -0.207 | -0.048 |
| 3.716504109196633 | 0.839 | -0.204 | -0.051 |
| 3.719645701850223 | 0.838 | -0.201 | -0.054 |
| 3.722787294503812 | 0.836 | -0.199 | -0.057 |
| 3.725928887157402 | 0.834 | -0.196 | -0.06 |
| 3.729070479810991 | 0.832 | -0.193 | -0.063 |
| 3.732212072464581 | 0.831 | -0.19 | -0.067 |
| 3.735353665118171 | 0.829 | -0.187 | -0.07 |
| 3.73849525777176 | 0.827 | -0.184 | -0.073 |
| 3.74163685042535 | 0.825 | -0.181 | -0.076 |
| 3.744778443078939 | 0.824 | -0.178 | -0.079 |
| 3.747920035732529 | 0.822 | -0.175 | -0.082 |
| 3.751061628386119 | 0.82 | -0.172 | -0.085 |
| 3.754203221039708 | 0.818 | -0.169 | -0.088 |
| 3.757344813693298 | 0.816 | -0.166 | -0.091 |
| 3.760486406346887 | 0.815 | -0.163 | -0.094 |
| 3.763627999000477 | 0.813 | -0.16 | -0.097 |
| 3.766769591654067 | 0.811 | -0.157 | -0.1 |
| 3.769911184307656 | 0.809 | -0.155 | -0.103 |
| 3.773052776961246 | 0.807 | -0.152 | -0.106 |
| 3.776194369614835 | 0.805 | -0.149 | -0.109 |
| 3.779335962268425 | 0.803 | -0.146 | -0.112 |
| 3.782477554922014 | 0.802 | -0.143 | -0.115 |
| 3.785619147575604 | 0.8 | -0.139 | -0.118 |
| 3.788760740229193 | 0.798 | -0.136 | -0.121 |
| 3.791902332882783 | 0.796 | -0.133 | -0.124 |
| 3.795043925536373 | 0.794 | -0.13 | -0.127 |
| 3.798185518189962 | 0.792 | -0.127 | -0.129 |
| 3.801327110843552 | 0.79 | -0.124 | -0.132 |
| 3.804468703497142 | 0.788 | -0.121 | -0.135 |
| 3.807610296150731 | 0.786 | -0.118 | -0.138 |
| 3.810751888804321 | 0.784 | -0.115 | -0.141 |
| 3.813893481457911 | 0.782 | -0.112 | -0.144 |
| 3.8170350741115 | 0.78 | -0.109 | -0.147 |
| 3.82017666676509 | 0.778 | -0.106 | -0.149 |
| 3.823318259418679 | 0.776 | -0.103 | -0.152 |
| 3.826459852072269 | 0.775 | -0.1 | -0.155 |
| 3.829601444725859 | 0.773 | -0.097 | -0.158 |
| 3.832743037379448 | 0.771 | -0.094 | -0.161 |
| 3.835884630033038 | 0.769 | -0.091 | -0.163 |
| 3.839026222686627 | 0.766 | -0.088 | -0.166 |
| 3.842167815340217 | 0.764 | -0.084 | -0.169 |
| 3.845309407993807 | 0.762 | -0.081 | -0.171 |
| 3.848451000647396 | 0.76 | -0.078 | -0.174 |
| 3.851592593300986 | 0.758 | -0.075 | -0.177 |
| 3.854734185954575 | 0.756 | -0.072 | -0.179 |
| 3.857875778608165 | 0.754 | -0.069 | -0.182 |
| 3.861017371261755 | 0.752 | -0.066 | -0.185 |
| 3.864158963915344 | 0.75 | -0.063 | -0.187 |
| 3.867300556568933 | 0.748 | -0.06 | -0.19 |
| 3.870442149222523 | 0.746 | -0.056 | -0.193 |
| 3.873583741876112 | 0.744 | -0.053 | -0.195 |
| 3.876725334529703 | 0.742 | -0.05 | -0.198 |
| 3.879866927183292 | 0.74 | -0.047 | -0.2 |
| 3.883008519836882 | 0.738 | -0.044 | -0.203 |
| 3.886150112490471 | 0.735 | -0.041 | -0.205 |
| 3.889291705144061 | 0.733 | -0.038 | -0.208 |
| 3.892433297797651 | 0.731 | -0.035 | -0.21 |
| 3.89557489045124 | 0.729 | -0.031 | -0.212 |
| 3.89871648310483 | 0.727 | -0.028 | -0.215 |
| 3.901858075758419 | 0.725 | -0.025 | -0.217 |
| 3.904999668412009 | 0.722 | -0.022 | -0.22 |
| 3.908141261065598 | 0.72 | -0.019 | -0.222 |
| 3.911282853719188 | 0.718 | -0.016 | -0.224 |
| 3.914424446372778 | 0.716 | -0.013 | -0.227 |
| 3.917566039026367 | 0.714 | -0.009 | -0.229 |
| 3.920707631679957 | 0.712 | -0.006 | -0.231 |
| 3.923849224333547 | 0.709 | -0.003 | -0.233 |
| 3.926990816987136 | 0.707 | 0 | -0.236 |
| 3.930132409640726 | 0.705 | 0.003 | -0.238 |
| 3.933274002294315 | 0.703 | 0.006 | -0.24 |
| 3.936415594947905 | 0.7 | 0.009 | -0.242 |
| 3.939557187601495 | 0.698 | 0.013 | -0.244 |
| 3.942698780255084 | 0.696 | 0.016 | -0.247 |
| 3.945840372908674 | 0.694 | 0.019 | -0.249 |
| 3.948981965562263 | 0.691 | 0.022 | -0.251 |
| 3.952123558215853 | 0.689 | 0.025 | -0.253 |
| 3.955265150869442 | 0.687 | 0.028 | -0.255 |
| 3.958406743523032 | 0.685 | 0.031 | -0.257 |
| 3.961548336176622 | 0.682 | 0.035 | -0.259 |
| 3.964689928830211 | 0.68 | 0.038 | -0.261 |
| 3.967831521483801 | 0.678 | 0.041 | -0.263 |
| 3.97097311413739 | 0.675 | 0.044 | -0.265 |
| 3.97411470679098 | 0.673 | 0.047 | -0.267 |
| 3.97725629944457 | 0.671 | 0.05 | -0.268 |
| 3.98039789209816 | 0.668 | 0.053 | -0.27 |
| 3.983539484751749 | 0.666 | 0.056 | -0.272 |
| 3.986681077405338 | 0.664 | 0.06 | -0.274 |
| 3.989822670058928 | 0.661 | 0.063 | -0.276 |
| 3.992964262712517 | 0.659 | 0.066 | -0.277 |
| 3.996105855366107 | 0.657 | 0.069 | -0.279 |
| 3.999247448019697 | 0.654 | 0.072 | -0.281 |
| 4.002389040673287 | 0.652 | 0.075 | -0.283 |
| 4.005530633326877 | 0.649 | 0.078 | -0.284 |
| 4.008672225980466 | 0.647 | 0.081 | -0.286 |
| 4.011813818634056 | 0.645 | 0.084 | -0.287 |
| 4.014955411287645 | 0.642 | 0.088 | -0.289 |
| 4.018097003941234 | 0.64 | 0.091 | -0.291 |
| 4.021238596594824 | 0.637 | 0.094 | -0.292 |
| 4.024380189248414 | 0.635 | 0.097 | -0.294 |
| 4.027521781902004 | 0.633 | 0.1 | -0.295 |
| 4.030663374555593 | 0.63 | 0.103 | -0.297 |
| 4.033804967209183 | 0.628 | 0.106 | -0.298 |
| 4.036946559862773 | 0.625 | 0.109 | -0.299 |
| 4.040088152516362 | 0.623 | 0.112 | -0.301 |
| 4.043229745169951 | 0.62 | 0.115 | -0.302 |
| 4.046371337823541 | 0.618 | 0.118 | -0.303 |
| 4.049512930477131 | 0.615 | 0.121 | -0.305 |
| 4.05265452313072 | 0.613 | 0.124 | -0.306 |
| 4.05579611578431 | 0.61 | 0.127 | -0.307 |
| 4.0589377084379 | 0.608 | 0.13 | -0.308 |
| 4.062079301091489 | 0.605 | 0.133 | -0.31 |
| 4.065220893745079 | 0.603 | 0.136 | -0.311 |
| 4.068362486398668 | 0.6 | 0.139 | -0.312 |
| 4.071504079052258 | 0.598 | 0.143 | -0.313 |
| 4.074645671705848 | 0.595 | 0.146 | -0.314 |
| 4.077787264359437 | 0.593 | 0.149 | -0.315 |
| 4.080928857013027 | 0.59 | 0.152 | -0.316 |
| 4.084070449666616 | 0.588 | 0.155 | -0.317 |
| 4.087212042320206 | 0.585 | 0.157 | -0.318 |
| 4.090353634973795 | 0.583 | 0.16 | -0.319 |
| 4.093495227627385 | 0.58 | 0.163 | -0.32 |
| 4.096636820280975 | 0.578 | 0.166 | -0.321 |
| 4.099778412934564 | 0.575 | 0.169 | -0.322 |
| 4.102920005588154 | 0.572 | 0.172 | -0.322 |
| 4.106061598241744 | 0.57 | 0.175 | -0.323 |
| 4.109203190895333 | 0.567 | 0.178 | -0.324 |
| 4.112344783548923 | 0.565 | 0.181 | -0.325 |
| 4.115486376202512 | 0.562 | 0.184 | -0.325 |
| 4.118627968856102 | 0.559 | 0.187 | -0.326 |
| 4.121769561509692 | 0.557 | 0.19 | -0.327 |
| 4.124911154163281 | 0.554 | 0.193 | -0.327 |
| 4.128052746816871 | 0.552 | 0.196 | -0.328 |
| 4.13119433947046 | 0.549 | 0.199 | -0.328 |
| 4.13433593212405 | 0.546 | 0.201 | -0.329 |
| 4.13747752477764 | 0.544 | 0.204 | -0.329 |
| 4.14061911743123 | 0.541 | 0.207 | -0.33 |
| 4.143760710084818 | 0.538 | 0.21 | -0.33 |
| 4.146902302738408 | 0.536 | 0.213 | -0.331 |
| 4.150043895391998 | 0.533 | 0.216 | -0.331 |
| 4.153185488045588 | 0.531 | 0.219 | -0.331 |
| 4.156327080699177 | 0.528 | 0.221 | -0.332 |
| 4.159468673352766 | 0.525 | 0.224 | -0.332 |
| 4.162610266006356 | 0.522 | 0.227 | -0.332 |
| 4.165751858659946 | 0.52 | 0.23 | -0.333 |
| 4.168893451313535 | 0.517 | 0.233 | -0.333 |
| 4.172035043967125 | 0.514 | 0.235 | -0.333 |
| 4.175176636620715 | 0.512 | 0.238 | -0.333 |
| 4.178318229274304 | 0.509 | 0.241 | -0.333 |
| 4.181459821927894 | 0.506 | 0.244 | -0.333 |
| 4.184601414581484 | 0.504 | 0.246 | -0.333 |
| 4.187743007235073 | 0.501 | 0.249 | -0.333 |
| 4.190884599888663 | 0.498 | 0.252 | -0.333 |
| 4.194026192542252 | 0.495 | 0.255 | -0.333 |
| 4.197167785195842 | 0.493 | 0.257 | -0.333 |
| 4.200309377849432 | 0.49 | 0.26 | -0.333 |
| 4.203450970503021 | 0.487 | 0.263 | -0.333 |
| 4.206592563156611 | 0.485 | 0.265 | -0.333 |
| 4.2097341558102 | 0.482 | 0.268 | -0.333 |
| 4.21287574846379 | 0.479 | 0.271 | -0.332 |
| 4.21601734111738 | 0.476 | 0.273 | -0.332 |
| 4.21915893377097 | 0.473 | 0.276 | -0.332 |
| 4.222300526424559 | 0.471 | 0.278 | -0.332 |
| 4.225442119078148 | 0.468 | 0.281 | -0.331 |
| 4.228583711731738 | 0.465 | 0.284 | -0.331 |
| 4.231725304385327 | 0.462 | 0.286 | -0.331 |
| 4.234866897038917 | 0.46 | 0.289 | -0.33 |
| 4.238008489692506 | 0.457 | 0.291 | -0.33 |
| 4.241150082346096 | 0.454 | 0.294 | -0.329 |
| 4.244291674999685 | 0.451 | 0.296 | -0.329 |
| 4.247433267653276 | 0.448 | 0.299 | -0.328 |
| 4.250574860306865 | 0.446 | 0.301 | -0.328 |
| 4.253716452960455 | 0.443 | 0.304 | -0.327 |
| 4.256858045614044 | 0.44 | 0.306 | -0.326 |
| 4.259999638267634 | 0.437 | 0.309 | -0.326 |
| 4.263141230921224 | 0.434 | 0.311 | -0.325 |
| 4.266282823574813 | 0.431 | 0.314 | -0.324 |
| 4.269424416228403 | 0.429 | 0.316 | -0.324 |
| 4.272566008881992 | 0.426 | 0.319 | -0.323 |
| 4.275707601535582 | 0.423 | 0.321 | -0.322 |
| 4.27884919418917 | 0.42 | 0.324 | -0.321 |
| 4.28199078684276 | 0.417 | 0.326 | -0.32 |
| 4.285132379496351 | 0.414 | 0.328 | -0.32 |
| 4.28827397214994 | 0.412 | 0.331 | -0.319 |
| 4.29141556480353 | 0.409 | 0.333 | -0.318 |
| 4.294557157457119 | 0.406 | 0.335 | -0.317 |
| 4.29769875011071 | 0.403 | 0.338 | -0.316 |
| 4.300840342764299 | 0.4 | 0.34 | -0.315 |
| 4.303981935417888 | 0.397 | 0.342 | -0.314 |
| 4.307123528071478 | 0.394 | 0.345 | -0.313 |
| 4.310265120725067 | 0.391 | 0.347 | -0.311 |
| 4.313406713378657 | 0.388 | 0.349 | -0.31 |
| 4.316548306032247 | 0.386 | 0.351 | -0.309 |
| 4.319689898685836 | 0.383 | 0.354 | -0.308 |
| 4.322831491339426 | 0.38 | 0.356 | -0.307 |
| 4.325973083993015 | 0.377 | 0.358 | -0.306 |
| 4.329114676646605 | 0.374 | 0.36 | -0.304 |
| 4.332256269300195 | 0.371 | 0.362 | -0.303 |
| 4.335397861953784 | 0.368 | 0.364 | -0.302 |
| 4.338539454607374 | 0.365 | 0.367 | -0.3 |
| 4.341681047260963 | 0.362 | 0.369 | -0.299 |
| 4.344822639914553 | 0.359 | 0.371 | -0.297 |
| 4.347964232568143 | 0.356 | 0.373 | -0.296 |
| 4.351105825221732 | 0.353 | 0.375 | -0.295 |
| 4.354247417875322 | 0.351 | 0.377 | -0.293 |
| 4.357389010528911 | 0.348 | 0.379 | -0.292 |
| 4.360530603182501 | 0.345 | 0.381 | -0.29 |
| 4.36367219583609 | 0.342 | 0.383 | -0.289 |
| 4.36681378848968 | 0.339 | 0.385 | -0.287 |
| 4.36995538114327 | 0.336 | 0.387 | -0.285 |
| 4.373096973796859 | 0.333 | 0.389 | -0.284 |
| 4.376238566450449 | 0.33 | 0.391 | -0.282 |
| 4.379380159104038 | 0.327 | 0.393 | -0.28 |
| 4.382521751757628 | 0.324 | 0.395 | -0.279 |
| 4.385663344411217 | 0.321 | 0.397 | -0.277 |
| 4.388804937064807 | 0.318 | 0.399 | -0.275 |
| 4.391946529718397 | 0.315 | 0.401 | -0.273 |
| 4.395088122371987 | 0.312 | 0.403 | -0.272 |
| 4.398229715025576 | 0.309 | 0.405 | -0.27 |
| 4.401371307679165 | 0.306 | 0.406 | -0.268 |
| 4.404512900332755 | 0.303 | 0.408 | -0.266 |
| 4.407654492986345 | 0.3 | 0.41 | -0.264 |
| 4.410796085639934 | 0.297 | 0.412 | -0.262 |
| 4.413937678293524 | 0.294 | 0.414 | -0.26 |
| 4.417079270947114 | 0.291 | 0.415 | -0.258 |
| 4.420220863600703 | 0.288 | 0.417 | -0.256 |
| 4.423362456254293 | 0.285 | 0.419 | -0.254 |
| 4.426504048907883 | 0.282 | 0.42 | -0.252 |
| 4.429645641561472 | 0.279 | 0.422 | -0.25 |
| 4.432787234215062 | 0.276 | 0.424 | -0.248 |
| 4.435928826868651 | 0.273 | 0.425 | -0.246 |
| 4.43907041952224 | 0.27 | 0.427 | -0.244 |
| 4.44221201217583 | 0.267 | 0.429 | -0.242 |
| 4.44535360482942 | 0.264 | 0.43 | -0.239 |
| 4.44849519748301 | 0.261 | 0.432 | -0.237 |
| 4.4516367901366 | 0.258 | 0.434 | -0.235 |
| 4.454778382790188 | 0.255 | 0.435 | -0.233 |
| 4.457919975443779 | 0.252 | 0.437 | -0.23 |
| 4.461061568097368 | 0.249 | 0.438 | -0.228 |
| 4.464203160750958 | 0.246 | 0.44 | -0.226 |
| 4.467344753404547 | 0.243 | 0.441 | -0.224 |
| 4.470486346058137 | 0.24 | 0.443 | -0.221 |
| 4.473627938711726 | 0.236 | 0.444 | -0.219 |
| 4.476769531365316 | 0.233 | 0.446 | -0.216 |
| 4.479911124018905 | 0.23 | 0.447 | -0.214 |
| 4.483052716672495 | 0.227 | 0.448 | -0.212 |
| 4.486194309326085 | 0.224 | 0.45 | -0.209 |
| 4.489335901979674 | 0.221 | 0.451 | -0.207 |
| 4.492477494633264 | 0.218 | 0.452 | -0.204 |
| 4.495619087286854 | 0.215 | 0.454 | -0.202 |
| 4.498760679940443 | 0.212 | 0.455 | -0.199 |
| 4.501902272594033 | 0.209 | 0.456 | -0.197 |
| 4.505043865247622 | 0.206 | 0.458 | -0.194 |
| 4.508185457901212 | 0.203 | 0.459 | -0.192 |
| 4.511327050554801 | 0.2 | 0.46 | -0.189 |
| 4.514468643208391 | 0.197 | 0.461 | -0.186 |
| 4.517610235861981 | 0.194 | 0.463 | -0.184 |
| 4.520751828515571 | 0.19 | 0.464 | -0.181 |
| 4.52389342116916 | 0.187 | 0.465 | -0.179 |
| 4.52703501382275 | 0.184 | 0.466 | -0.176 |
| 4.530176606476339 | 0.181 | 0.467 | -0.173 |
| 4.533318199129928 | 0.178 | 0.468 | -0.171 |
| 4.536459791783518 | 0.175 | 0.469 | -0.168 |
| 4.539601384437108 | 0.172 | 0.47 | -0.165 |
| 4.542742977090698 | 0.169 | 0.471 | -0.162 |
| 4.545884569744287 | 0.166 | 0.473 | -0.16 |
| 4.549026162397876 | 0.163 | 0.474 | -0.157 |
| 4.552167755051466 | 0.16 | 0.475 | -0.154 |
| 4.555309347705056 | 0.156 | 0.476 | -0.151 |
| 4.558450940358646 | 0.153 | 0.476 | -0.149 |
| 4.561592533012235 | 0.15 | 0.477 | -0.146 |
| 4.564734125665825 | 0.147 | 0.478 | -0.143 |
| 4.567875718319415 | 0.144 | 0.479 | -0.14 |
| 4.571017310973004 | 0.141 | 0.48 | -0.137 |
| 4.574158903626594 | 0.138 | 0.481 | -0.134 |
| 4.577300496280183 | 0.135 | 0.482 | -0.131 |
| 4.580442088933772 | 0.132 | 0.483 | -0.129 |
| 4.583583681587362 | 0.128 | 0.484 | -0.126 |
| 4.586725274240952 | 0.125 | 0.484 | -0.123 |
| 4.589866866894542 | 0.122 | 0.485 | -0.12 |
| 4.593008459548131 | 0.119 | 0.486 | -0.117 |
| 4.596150052201721 | 0.116 | 0.487 | -0.114 |
| 4.59929164485531 | 0.113 | 0.487 | -0.111 |
| 4.6024332375089 | 0.11 | 0.488 | -0.108 |
| 4.60557483016249 | 0.107 | 0.489 | -0.105 |
| 4.608716422816079 | 0.103 | 0.489 | -0.102 |
| 4.611858015469668 | 0.1 | 0.49 | -0.099 |
| 4.614999608123258 | 0.097 | 0.491 | -0.096 |
| 4.618141200776848 | 0.094 | 0.491 | -0.093 |
| 4.621282793430437 | 0.091 | 0.492 | -0.09 |
| 4.624424386084027 | 0.088 | 0.492 | -0.087 |
| 4.627565978737617 | 0.085 | 0.493 | -0.084 |
| 4.630707571391206 | 0.082 | 0.493 | -0.081 |
| 4.633849164044795 | 0.078 | 0.494 | -0.078 |
| 4.636990756698386 | 0.075 | 0.494 | -0.075 |
| 4.640132349351975 | 0.072 | 0.495 | -0.072 |
| 4.643273942005564 | 0.069 | 0.495 | -0.069 |
| 4.646415534659154 | 0.066 | 0.496 | -0.066 |
| 4.649557127312744 | 0.063 | 0.496 | -0.062 |
| 4.652698719966334 | 0.06 | 0.496 | -0.059 |
| 4.655840312619923 | 0.057 | 0.497 | -0.056 |
| 4.658981905273513 | 0.053 | 0.497 | -0.053 |
| 4.662123497927102 | 0.05 | 0.497 | -0.05 |
| 4.665265090580692 | 0.047 | 0.498 | -0.047 |
| 4.668406683234282 | 0.044 | 0.498 | -0.044 |
| 4.671548275887871 | 0.041 | 0.498 | -0.041 |
| 4.674689868541461 | 0.038 | 0.499 | -0.038 |
| 4.67783146119505 | 0.035 | 0.499 | -0.034 |
| 4.68097305384864 | 0.031 | 0.499 | -0.031 |
| 4.68411464650223 | 0.028 | 0.499 | -0.028 |
| 4.687256239155819 | 0.025 | 0.499 | -0.025 |
| 4.690397831809409 | 0.022 | 0.5 | -0.022 |
| 4.693539424462998 | 0.019 | 0.5 | -0.019 |
| 4.696681017116588 | 0.016 | 0.5 | -0.016 |
| 4.699822609770177 | 0.013 | 0.5 | -0.013 |
| 4.702964202423767 | 0.009 | 0.5 | -0.009 |
| 4.706105795077356 | 0.006 | 0.5 | -0.006 |
| 4.709247387730946 | 0.003 | 0.5 | -0.003 |
| 4.712388980384535 | 0 | 0.5 | 0 |
| 4.715530573038126 | -0.003 | 0.5 | 0.003 |
| 4.718672165691715 | -0.006 | 0.5 | 0.006 |
| 4.721813758345305 | -0.009 | 0.5 | 0.009 |
| 4.724955350998894 | -0.013 | 0.5 | 0.013 |
| 4.728096943652484 | -0.016 | 0.5 | 0.016 |
| 4.731238536306074 | -0.019 | 0.5 | 0.019 |
| 4.734380128959663 | -0.022 | 0.5 | 0.022 |
| 4.737521721613253 | -0.025 | 0.499 | 0.025 |
| 4.740663314266842 | -0.028 | 0.499 | 0.028 |
| 4.743804906920432 | -0.031 | 0.499 | 0.031 |
| 4.74694649957402 | -0.035 | 0.499 | 0.034 |
| 4.750088092227611 | -0.038 | 0.499 | 0.038 |
| 4.7532296848812 | -0.041 | 0.498 | 0.041 |
| 4.75637127753479 | -0.044 | 0.498 | 0.044 |
| 4.75951287018838 | -0.047 | 0.498 | 0.047 |
| 4.76265446284197 | -0.05 | 0.497 | 0.05 |
| 4.765796055495559 | -0.053 | 0.497 | 0.053 |
| 4.768937648149149 | -0.057 | 0.497 | 0.056 |
| 4.772079240802738 | -0.06 | 0.496 | 0.059 |
| 4.775220833456327 | -0.063 | 0.496 | 0.062 |
| 4.778362426109917 | -0.066 | 0.496 | 0.066 |
| 4.781504018763507 | -0.069 | 0.495 | 0.069 |
| 4.784645611417097 | -0.072 | 0.495 | 0.072 |
| 4.787787204070686 | -0.075 | 0.494 | 0.075 |
| 4.790928796724275 | -0.078 | 0.494 | 0.078 |
| 4.794070389377865 | -0.082 | 0.493 | 0.081 |
| 4.797211982031455 | -0.085 | 0.493 | 0.084 |
| 4.800353574685045 | -0.088 | 0.492 | 0.087 |
| 4.803495167338634 | -0.091 | 0.492 | 0.09 |
| 4.806636759992224 | -0.094 | 0.491 | 0.093 |
| 4.809778352645814 | -0.097 | 0.491 | 0.096 |
| 4.812919945299403 | -0.1 | 0.49 | 0.099 |
| 4.816061537952993 | -0.103 | 0.489 | 0.102 |
| 4.819203130606582 | -0.107 | 0.489 | 0.105 |
| 4.822344723260172 | -0.11 | 0.488 | 0.108 |
| 4.825486315913761 | -0.113 | 0.487 | 0.111 |
| 4.828627908567351 | -0.116 | 0.487 | 0.114 |
| 4.83176950122094 | -0.119 | 0.486 | 0.117 |
| 4.83491109387453 | -0.122 | 0.485 | 0.12 |
| 4.83805268652812 | -0.125 | 0.484 | 0.123 |
| 4.841194279181709 | -0.128 | 0.484 | 0.126 |
| 4.844335871835299 | -0.132 | 0.483 | 0.129 |
| 4.847477464488889 | -0.135 | 0.482 | 0.131 |
| 4.850619057142478 | -0.138 | 0.481 | 0.134 |
| 4.853760649796068 | -0.141 | 0.48 | 0.137 |
| 4.856902242449657 | -0.144 | 0.479 | 0.14 |
| 4.860043835103247 | -0.147 | 0.478 | 0.143 |
| 4.863185427756837 | -0.15 | 0.477 | 0.146 |
| 4.866327020410426 | -0.153 | 0.476 | 0.149 |
| 4.869468613064015 | -0.156 | 0.476 | 0.151 |
| 4.872610205717605 | -0.16 | 0.475 | 0.154 |
| 4.875751798371195 | -0.163 | 0.474 | 0.157 |
| 4.878893391024784 | -0.166 | 0.473 | 0.16 |
| 4.882034983678374 | -0.169 | 0.471 | 0.162 |
| 4.885176576331964 | -0.172 | 0.47 | 0.165 |
| 4.888318168985553 | -0.175 | 0.469 | 0.168 |
| 4.891459761639143 | -0.178 | 0.468 | 0.171 |
| 4.894601354292733 | -0.181 | 0.467 | 0.173 |
| 4.897742946946322 | -0.184 | 0.466 | 0.176 |
| 4.900884539599912 | -0.187 | 0.465 | 0.179 |
| 4.904026132253501 | -0.19 | 0.464 | 0.181 |
| 4.907167724907091 | -0.194 | 0.463 | 0.184 |
| 4.91030931756068 | -0.197 | 0.461 | 0.186 |
| 4.91345091021427 | -0.2 | 0.46 | 0.189 |
| 4.91659250286786 | -0.203 | 0.459 | 0.192 |
| 4.91973409552145 | -0.206 | 0.458 | 0.194 |
| 4.922875688175039 | -0.209 | 0.456 | 0.197 |
| 4.926017280828628 | -0.212 | 0.455 | 0.199 |
| 4.929158873482218 | -0.215 | 0.454 | 0.202 |
| 4.932300466135808 | -0.218 | 0.452 | 0.204 |
| 4.935442058789397 | -0.221 | 0.451 | 0.207 |
| 4.938583651442987 | -0.224 | 0.45 | 0.209 |
| 4.941725244096576 | -0.227 | 0.448 | 0.212 |
| 4.944866836750166 | -0.23 | 0.447 | 0.214 |
| 4.948008429403755 | -0.233 | 0.446 | 0.216 |
| 4.951150022057345 | -0.236 | 0.444 | 0.219 |
| 4.954291614710935 | -0.24 | 0.443 | 0.221 |
| 4.957433207364524 | -0.243 | 0.441 | 0.224 |
| 4.960574800018114 | -0.246 | 0.44 | 0.226 |
| 4.963716392671704 | -0.249 | 0.438 | 0.228 |
| 4.966857985325293 | -0.252 | 0.437 | 0.23 |
| 4.969999577978883 | -0.255 | 0.435 | 0.233 |
| 4.973141170632472 | -0.258 | 0.434 | 0.235 |
| 4.976282763286062 | -0.261 | 0.432 | 0.237 |
| 4.979424355939651 | -0.264 | 0.43 | 0.239 |
| 4.982565948593241 | -0.267 | 0.429 | 0.242 |
| 4.985707541246831 | -0.27 | 0.427 | 0.244 |
| 4.98884913390042 | -0.273 | 0.425 | 0.246 |
| 4.99199072655401 | -0.276 | 0.424 | 0.248 |
| 4.9951323192076 | -0.279 | 0.422 | 0.25 |
| 4.99827391186119 | -0.282 | 0.42 | 0.252 |
| 5.00141550451478 | -0.285 | 0.419 | 0.254 |
| 5.004557097168369 | -0.288 | 0.417 | 0.256 |
| 5.007698689821958 | -0.291 | 0.415 | 0.258 |
| 5.010840282475548 | -0.294 | 0.414 | 0.26 |
| 5.013981875129137 | -0.297 | 0.412 | 0.262 |
| 5.017123467782727 | -0.3 | 0.41 | 0.264 |
| 5.020265060436317 | -0.303 | 0.408 | 0.266 |
| 5.023406653089906 | -0.306 | 0.406 | 0.268 |
| 5.026548245743496 | -0.309 | 0.405 | 0.27 |
| 5.029689838397085 | -0.312 | 0.403 | 0.272 |
| 5.032831431050674 | -0.315 | 0.401 | 0.273 |
| 5.035973023704264 | -0.318 | 0.399 | 0.275 |
| 5.039114616357854 | -0.321 | 0.397 | 0.277 |
| 5.042256209011444 | -0.324 | 0.395 | 0.279 |
| 5.045397801665033 | -0.327 | 0.393 | 0.28 |
| 5.048539394318622 | -0.33 | 0.391 | 0.282 |
| 5.051680986972213 | -0.333 | 0.389 | 0.284 |
| 5.054822579625802 | -0.336 | 0.387 | 0.285 |
| 5.057964172279392 | -0.339 | 0.385 | 0.287 |
| 5.061105764932981 | -0.342 | 0.383 | 0.289 |
| 5.064247357586571 | -0.345 | 0.381 | 0.29 |
| 5.067388950240161 | -0.348 | 0.379 | 0.292 |
| 5.07053054289375 | -0.351 | 0.377 | 0.293 |
| 5.07367213554734 | -0.353 | 0.375 | 0.295 |
| 5.07681372820093 | -0.356 | 0.373 | 0.296 |
| 5.079955320854519 | -0.359 | 0.371 | 0.297 |
| 5.083096913508108 | -0.362 | 0.369 | 0.299 |
| 5.086238506161698 | -0.365 | 0.367 | 0.3 |
| 5.089380098815288 | -0.368 | 0.364 | 0.302 |
| 5.092521691468877 | -0.371 | 0.362 | 0.303 |
| 5.095663284122466 | -0.374 | 0.36 | 0.304 |
| 5.098804876776057 | -0.377 | 0.358 | 0.306 |
| 5.101946469429646 | -0.38 | 0.356 | 0.307 |
| 5.105088062083236 | -0.383 | 0.354 | 0.308 |
| 5.108229654736825 | -0.386 | 0.351 | 0.309 |
| 5.111371247390415 | -0.388 | 0.349 | 0.31 |
| 5.114512840044005 | -0.391 | 0.347 | 0.311 |
| 5.117654432697594 | -0.394 | 0.345 | 0.313 |
| 5.120796025351184 | -0.397 | 0.342 | 0.314 |
| 5.123937618004773 | -0.4 | 0.34 | 0.315 |
| 5.127079210658363 | -0.403 | 0.338 | 0.316 |
| 5.130220803311953 | -0.406 | 0.335 | 0.317 |
| 5.133362395965542 | -0.409 | 0.333 | 0.318 |
| 5.136503988619131 | -0.412 | 0.331 | 0.319 |
| 5.13964558127272 | -0.414 | 0.328 | 0.32 |
| 5.142787173926311 | -0.417 | 0.326 | 0.32 |
| 5.1459287665799 | -0.42 | 0.324 | 0.321 |
| 5.14907035923349 | -0.423 | 0.321 | 0.322 |
| 5.15221195188708 | -0.426 | 0.319 | 0.323 |
| 5.15535354454067 | -0.429 | 0.316 | 0.324 |
| 5.158495137194259 | -0.431 | 0.314 | 0.324 |
| 5.161636729847848 | -0.434 | 0.311 | 0.325 |
| 5.164778322501438 | -0.437 | 0.309 | 0.326 |
| 5.167919915155028 | -0.44 | 0.306 | 0.326 |
| 5.171061507808617 | -0.443 | 0.304 | 0.327 |
| 5.174203100462206 | -0.446 | 0.301 | 0.328 |
| 5.177344693115796 | -0.448 | 0.299 | 0.328 |
| 5.180486285769386 | -0.451 | 0.296 | 0.329 |
| 5.183627878422976 | -0.454 | 0.294 | 0.329 |
| 5.186769471076565 | -0.457 | 0.291 | 0.33 |
| 5.189911063730155 | -0.46 | 0.289 | 0.33 |
| 5.193052656383744 | -0.462 | 0.286 | 0.331 |
| 5.196194249037334 | -0.465 | 0.284 | 0.331 |
| 5.199335841690924 | -0.468 | 0.281 | 0.331 |
| 5.202477434344513 | -0.471 | 0.278 | 0.332 |
| 5.205619026998103 | -0.473 | 0.276 | 0.332 |
| 5.208760619651692 | -0.476 | 0.273 | 0.332 |
| 5.211902212305282 | -0.479 | 0.271 | 0.332 |
| 5.215043804958871 | -0.482 | 0.268 | 0.333 |
| 5.218185397612461 | -0.485 | 0.265 | 0.333 |
| 5.221326990266051 | -0.487 | 0.263 | 0.333 |
| 5.22446858291964 | -0.49 | 0.26 | 0.333 |
| 5.22761017557323 | -0.493 | 0.257 | 0.333 |
| 5.23075176822682 | -0.495 | 0.255 | 0.333 |
| 5.23389336088041 | -0.498 | 0.252 | 0.333 |
| 5.237034953533999 | -0.501 | 0.249 | 0.333 |
| 5.240176546187588 | -0.504 | 0.246 | 0.333 |
| 5.243318138841178 | -0.506 | 0.244 | 0.333 |
| 5.246459731494767 | -0.509 | 0.241 | 0.333 |
| 5.249601324148357 | -0.512 | 0.238 | 0.333 |
| 5.252742916801947 | -0.514 | 0.235 | 0.333 |
| 5.255884509455536 | -0.517 | 0.233 | 0.333 |
| 5.259026102109125 | -0.52 | 0.23 | 0.333 |
| 5.262167694762715 | -0.522 | 0.227 | 0.332 |
| 5.265309287416305 | -0.525 | 0.224 | 0.332 |
| 5.268450880069895 | -0.528 | 0.221 | 0.332 |
| 5.271592472723484 | -0.531 | 0.219 | 0.331 |
| 5.274734065377074 | -0.533 | 0.216 | 0.331 |
| 5.277875658030664 | -0.536 | 0.213 | 0.331 |
| 5.281017250684253 | -0.538 | 0.21 | 0.33 |
| 5.284158843337843 | -0.541 | 0.207 | 0.33 |
| 5.287300435991432 | -0.544 | 0.204 | 0.329 |
| 5.290442028645022 | -0.546 | 0.201 | 0.329 |
| 5.293583621298612 | -0.549 | 0.199 | 0.328 |
| 5.296725213952201 | -0.552 | 0.196 | 0.328 |
| 5.299866806605791 | -0.554 | 0.193 | 0.327 |
| 5.30300839925938 | -0.557 | 0.19 | 0.327 |
| 5.30614999191297 | -0.559 | 0.187 | 0.326 |
| 5.30929158456656 | -0.562 | 0.184 | 0.325 |
| 5.312433177220149 | -0.565 | 0.181 | 0.325 |
| 5.315574769873739 | -0.567 | 0.178 | 0.324 |
| 5.318716362527328 | -0.57 | 0.175 | 0.323 |
| 5.321857955180918 | -0.572 | 0.172 | 0.322 |
| 5.324999547834508 | -0.575 | 0.169 | 0.322 |
| 5.328141140488097 | -0.578 | 0.166 | 0.321 |
| 5.331282733141686 | -0.58 | 0.163 | 0.32 |
| 5.334424325795276 | -0.583 | 0.16 | 0.319 |
| 5.337565918448866 | -0.585 | 0.157 | 0.318 |
| 5.340707511102456 | -0.588 | 0.155 | 0.317 |
| 5.343849103756045 | -0.59 | 0.152 | 0.316 |
| 5.346990696409634 | -0.593 | 0.149 | 0.315 |
| 5.350132289063224 | -0.595 | 0.146 | 0.314 |
| 5.353273881716814 | -0.598 | 0.143 | 0.313 |
| 5.356415474370403 | -0.6 | 0.139 | 0.312 |
| 5.359557067023993 | -0.603 | 0.136 | 0.311 |
| 5.362698659677583 | -0.605 | 0.133 | 0.31 |
| 5.365840252331172 | -0.608 | 0.13 | 0.308 |
| 5.368981844984762 | -0.61 | 0.127 | 0.307 |
| 5.372123437638351 | -0.613 | 0.124 | 0.306 |
| 5.375265030291941 | -0.615 | 0.121 | 0.305 |
| 5.378406622945531 | -0.618 | 0.118 | 0.303 |
| 5.38154821559912 | -0.62 | 0.115 | 0.302 |
| 5.38468980825271 | -0.623 | 0.112 | 0.301 |
| 5.387831400906299 | -0.625 | 0.109 | 0.299 |
| 5.39097299355989 | -0.628 | 0.106 | 0.298 |
| 5.394114586213479 | -0.63 | 0.103 | 0.297 |
| 5.397256178867068 | -0.633 | 0.1 | 0.295 |
| 5.400397771520657 | -0.635 | 0.097 | 0.294 |
| 5.403539364174247 | -0.637 | 0.094 | 0.292 |
| 5.406680956827837 | -0.64 | 0.091 | 0.291 |
| 5.409822549481426 | -0.642 | 0.088 | 0.289 |
| 5.412964142135016 | -0.645 | 0.084 | 0.287 |
| 5.416105734788605 | -0.647 | 0.081 | 0.286 |
| 5.419247327442195 | -0.649 | 0.078 | 0.284 |
| 5.422388920095785 | -0.652 | 0.075 | 0.283 |
| 5.425530512749375 | -0.654 | 0.072 | 0.281 |
| 5.428672105402964 | -0.657 | 0.069 | 0.279 |
| 5.431813698056554 | -0.659 | 0.066 | 0.277 |
| 5.434955290710143 | -0.661 | 0.063 | 0.276 |
| 5.438096883363733 | -0.664 | 0.06 | 0.274 |
| 5.441238476017322 | -0.666 | 0.056 | 0.272 |
| 5.444380068670912 | -0.668 | 0.053 | 0.27 |
| 5.447521661324502 | -0.671 | 0.05 | 0.268 |
| 5.450663253978091 | -0.673 | 0.047 | 0.267 |
| 5.453804846631681 | -0.675 | 0.044 | 0.265 |
| 5.456946439285271 | -0.678 | 0.041 | 0.263 |
| 5.46008803193886 | -0.68 | 0.038 | 0.261 |
| 5.46322962459245 | -0.682 | 0.035 | 0.259 |
| 5.466371217246039 | -0.685 | 0.031 | 0.257 |
| 5.46951280989963 | -0.687 | 0.028 | 0.255 |
| 5.472654402553218 | -0.689 | 0.025 | 0.253 |
| 5.475795995206808 | -0.691 | 0.022 | 0.251 |
| 5.478937587860398 | -0.694 | 0.019 | 0.249 |
| 5.482079180513987 | -0.696 | 0.016 | 0.247 |
| 5.485220773167577 | -0.698 | 0.013 | 0.244 |
| 5.488362365821166 | -0.7 | 0.009 | 0.242 |
| 5.491503958474756 | -0.703 | 0.006 | 0.24 |
| 5.494645551128346 | -0.705 | 0.003 | 0.238 |
| 5.497787143781935 | -0.707 | 0 | 0.236 |
| 5.500928736435525 | -0.709 | -0.003 | 0.233 |
| 5.504070329089115 | -0.712 | -0.006 | 0.231 |
| 5.507211921742704 | -0.714 | -0.009 | 0.229 |
| 5.510353514396294 | -0.716 | -0.013 | 0.227 |
| 5.513495107049883 | -0.718 | -0.016 | 0.224 |
| 5.516636699703473 | -0.72 | -0.019 | 0.222 |
| 5.519778292357062 | -0.722 | -0.022 | 0.22 |
| 5.522919885010652 | -0.725 | -0.025 | 0.217 |
| 5.526061477664242 | -0.727 | -0.028 | 0.215 |
| 5.529203070317831 | -0.729 | -0.031 | 0.212 |
| 5.532344662971421 | -0.731 | -0.035 | 0.21 |
| 5.535486255625011 | -0.733 | -0.038 | 0.208 |
| 5.5386278482786 | -0.735 | -0.041 | 0.205 |
| 5.54176944093219 | -0.738 | -0.044 | 0.203 |
| 5.544911033585779 | -0.74 | -0.047 | 0.2 |
| 5.54805262623937 | -0.742 | -0.05 | 0.198 |
| 5.551194218892959 | -0.744 | -0.053 | 0.195 |
| 5.554335811546548 | -0.746 | -0.056 | 0.193 |
| 5.557477404200137 | -0.748 | -0.06 | 0.19 |
| 5.560618996853727 | -0.75 | -0.063 | 0.187 |
| 5.563760589507317 | -0.752 | -0.066 | 0.185 |
| 5.566902182160906 | -0.754 | -0.069 | 0.182 |
| 5.570043774814496 | -0.756 | -0.072 | 0.179 |
| 5.573185367468086 | -0.758 | -0.075 | 0.177 |
| 5.576326960121675 | -0.76 | -0.078 | 0.174 |
| 5.579468552775264 | -0.762 | -0.081 | 0.171 |
| 5.582610145428854 | -0.764 | -0.084 | 0.169 |
| 5.585751738082444 | -0.766 | -0.088 | 0.166 |
| 5.588893330736034 | -0.769 | -0.091 | 0.163 |
| 5.592034923389623 | -0.771 | -0.094 | 0.161 |
| 5.595176516043213 | -0.773 | -0.097 | 0.158 |
| 5.598318108696803 | -0.775 | -0.1 | 0.155 |
| 5.601459701350392 | -0.776 | -0.103 | 0.152 |
| 5.604601294003982 | -0.778 | -0.106 | 0.149 |
| 5.607742886657571 | -0.78 | -0.109 | 0.147 |
| 5.610884479311161 | -0.782 | -0.112 | 0.144 |
| 5.61402607196475 | -0.784 | -0.115 | 0.141 |
| 5.61716766461834 | -0.786 | -0.118 | 0.138 |
| 5.62030925727193 | -0.788 | -0.121 | 0.135 |
| 5.623450849925519 | -0.79 | -0.124 | 0.132 |
| 5.626592442579109 | -0.792 | -0.127 | 0.129 |
| 5.629734035232698 | -0.794 | -0.13 | 0.127 |
| 5.632875627886288 | -0.796 | -0.133 | 0.124 |
| 5.636017220539878 | -0.798 | -0.136 | 0.121 |
| 5.639158813193467 | -0.8 | -0.139 | 0.118 |
| 5.642300405847057 | -0.802 | -0.143 | 0.115 |
| 5.645441998500646 | -0.803 | -0.146 | 0.112 |
| 5.648583591154236 | -0.805 | -0.149 | 0.109 |
| 5.651725183807825 | -0.807 | -0.152 | 0.106 |
| 5.654866776461415 | -0.809 | -0.155 | 0.103 |
| 5.658008369115005 | -0.811 | -0.157 | 0.1 |
| 5.661149961768594 | -0.813 | -0.16 | 0.097 |
| 5.664291554422184 | -0.815 | -0.163 | 0.094 |
| 5.667433147075774 | -0.816 | -0.166 | 0.091 |
| 5.670574739729363 | -0.818 | -0.169 | 0.088 |
| 5.673716332382953 | -0.82 | -0.172 | 0.085 |
| 5.676857925036542 | -0.822 | -0.175 | 0.082 |
| 5.679999517690132 | -0.824 | -0.178 | 0.079 |
| 5.683141110343721 | -0.825 | -0.181 | 0.076 |
| 5.686282702997311 | -0.827 | -0.184 | 0.073 |
| 5.689424295650901 | -0.829 | -0.187 | 0.07 |
| 5.69256588830449 | -0.831 | -0.19 | 0.067 |
| 5.69570748095808 | -0.832 | -0.193 | 0.063 |
| 5.69884907361167 | -0.834 | -0.196 | 0.06 |
| 5.701990666265259 | -0.836 | -0.199 | 0.057 |
| 5.705132258918849 | -0.838 | -0.201 | 0.054 |
| 5.708273851572438 | -0.839 | -0.204 | 0.051 |
| 5.711415444226028 | -0.841 | -0.207 | 0.048 |
| 5.714557036879618 | -0.843 | -0.21 | 0.045 |
| 5.717698629533207 | -0.844 | -0.213 | 0.042 |
| 5.720840222186797 | -0.846 | -0.216 | 0.039 |
| 5.723981814840386 | -0.848 | -0.219 | 0.036 |
| 5.727123407493976 | -0.849 | -0.221 | 0.032 |
| 5.730265000147565 | -0.851 | -0.224 | 0.029 |
| 5.733406592801155 | -0.853 | -0.227 | 0.026 |
| 5.736548185454744 | -0.854 | -0.23 | 0.023 |
| 5.739689778108334 | -0.856 | -0.233 | 0.02 |
| 5.742831370761924 | -0.858 | -0.235 | 0.017 |
| 5.745972963415514 | -0.859 | -0.238 | 0.014 |
| 5.749114556069103 | -0.861 | -0.241 | 0.01 |
| 5.752256148722693 | -0.862 | -0.244 | 0.007 |
| 5.755397741376282 | -0.864 | -0.246 | 0.004 |
| 5.758539334029872 | -0.866 | -0.249 | 0.001 |
| 5.761680926683462 | -0.867 | -0.252 | -0.002 |
| 5.764822519337051 | -0.869 | -0.255 | -0.005 |
| 5.767964111990641 | -0.87 | -0.257 | -0.008 |
| 5.77110570464423 | -0.872 | -0.26 | -0.012 |
| 5.77424729729782 | -0.873 | -0.263 | -0.015 |
| 5.77738888995141 | -0.875 | -0.265 | -0.018 |
| 5.780530482605 | -0.876 | -0.268 | -0.021 |
| 5.783672075258588 | -0.878 | -0.271 | -0.024 |
| 5.786813667912178 | -0.879 | -0.273 | -0.027 |
| 5.789955260565768 | -0.881 | -0.276 | -0.03 |
| 5.793096853219358 | -0.882 | -0.278 | -0.033 |
| 5.796238445872947 | -0.884 | -0.281 | -0.037 |
| 5.799380038526537 | -0.885 | -0.284 | -0.04 |
| 5.802521631180126 | -0.887 | -0.286 | -0.043 |
| 5.805663223833715 | -0.888 | -0.289 | -0.046 |
| 5.808804816487306 | -0.89 | -0.291 | -0.049 |
| 5.811946409140895 | -0.891 | -0.294 | -0.052 |
| 5.815088001794485 | -0.892 | -0.296 | -0.055 |
| 5.818229594448074 | -0.894 | -0.299 | -0.058 |
| 5.821371187101663 | -0.895 | -0.301 | -0.061 |
| 5.824512779755254 | -0.897 | -0.304 | -0.065 |
| 5.827654372408843 | -0.898 | -0.306 | -0.068 |
| 5.830795965062433 | -0.899 | -0.309 | -0.071 |
| 5.833937557716022 | -0.901 | -0.311 | -0.074 |
| 5.837079150369612 | -0.902 | -0.314 | -0.077 |
| 5.840220743023201 | -0.903 | -0.316 | -0.08 |
| 5.843362335676791 | -0.905 | -0.319 | -0.083 |
| 5.846503928330381 | -0.906 | -0.321 | -0.086 |
| 5.84964552098397 | -0.907 | -0.324 | -0.089 |
| 5.85278711363756 | -0.909 | -0.326 | -0.092 |
| 5.85592870629115 | -0.91 | -0.328 | -0.095 |
| 5.85907029894474 | -0.911 | -0.331 | -0.098 |
| 5.862211891598329 | -0.913 | -0.333 | -0.101 |
| 5.865353484251918 | -0.914 | -0.335 | -0.104 |
| 5.868495076905508 | -0.915 | -0.338 | -0.107 |
| 5.871636669559098 | -0.917 | -0.34 | -0.11 |
| 5.874778262212687 | -0.918 | -0.342 | -0.113 |
| 5.877919854866277 | -0.919 | -0.345 | -0.116 |
| 5.881061447519866 | -0.92 | -0.347 | -0.119 |
| 5.884203040173456 | -0.921 | -0.349 | -0.122 |
| 5.887344632827046 | -0.923 | -0.351 | -0.125 |
| 5.890486225480635 | -0.924 | -0.354 | -0.128 |
| 5.893627818134224 | -0.925 | -0.356 | -0.13 |
| 5.896769410787814 | -0.926 | -0.358 | -0.133 |
| 5.899911003441404 | -0.927 | -0.36 | -0.136 |
| 5.903052596094994 | -0.929 | -0.362 | -0.139 |
| 5.906194188748583 | -0.93 | -0.364 | -0.142 |
| 5.909335781402172 | -0.931 | -0.367 | -0.145 |
| 5.912477374055762 | -0.932 | -0.369 | -0.148 |
| 5.915618966709352 | -0.933 | -0.371 | -0.15 |
| 5.918760559362942 | -0.934 | -0.373 | -0.153 |
| 5.921902152016531 | -0.935 | -0.375 | -0.156 |
| 5.92504374467012 | -0.937 | -0.377 | -0.159 |
| 5.92818533732371 | -0.938 | -0.379 | -0.162 |
| 5.9313269299773 | -0.939 | -0.381 | -0.164 |
| 5.93446852263089 | -0.94 | -0.383 | -0.167 |
| 5.93761011528448 | -0.941 | -0.385 | -0.17 |
| 5.940751707938068 | -0.942 | -0.387 | -0.172 |
| 5.943893300591658 | -0.943 | -0.389 | -0.175 |
| 5.947034893245248 | -0.944 | -0.391 | -0.178 |
| 5.950176485898837 | -0.945 | -0.393 | -0.18 |
| 5.953318078552427 | -0.946 | -0.395 | -0.183 |
| 5.956459671206017 | -0.947 | -0.397 | -0.186 |
| 5.959601263859606 | -0.948 | -0.399 | -0.188 |
| 5.962742856513196 | -0.949 | -0.401 | -0.191 |
| 5.965884449166785 | -0.95 | -0.403 | -0.193 |
| 5.969026041820375 | -0.951 | -0.405 | -0.196 |
| 5.972167634473964 | -0.952 | -0.406 | -0.198 |
| 5.975309227127554 | -0.953 | -0.408 | -0.201 |
| 5.978450819781144 | -0.954 | -0.41 | -0.203 |
| 5.981592412434733 | -0.955 | -0.412 | -0.206 |
| 5.984734005088323 | -0.956 | -0.414 | -0.208 |
| 5.987875597741913 | -0.957 | -0.415 | -0.211 |
| 5.991017190395502 | -0.958 | -0.417 | -0.213 |
| 5.994158783049092 | -0.959 | -0.419 | -0.216 |
| 5.997300375702681 | -0.959 | -0.42 | -0.218 |
| 6.000441968356271 | -0.96 | -0.422 | -0.22 |
| 6.003583561009861 | -0.961 | -0.424 | -0.223 |
| 6.00672515366345 | -0.962 | -0.425 | -0.225 |
| 6.00986674631704 | -0.963 | -0.427 | -0.227 |
| 6.01300833897063 | -0.964 | -0.429 | -0.23 |
| 6.01614993162422 | -0.965 | -0.43 | -0.232 |
| 6.019291524277808 | -0.965 | -0.432 | -0.234 |
| 6.022433116931398 | -0.966 | -0.434 | -0.236 |
| 6.025574709584988 | -0.967 | -0.435 | -0.239 |
| 6.028716302238577 | -0.968 | -0.437 | -0.241 |
| 6.031857894892167 | -0.969 | -0.438 | -0.243 |
| 6.034999487545757 | -0.969 | -0.44 | -0.245 |
| 6.038141080199346 | -0.97 | -0.441 | -0.247 |
| 6.041282672852935 | -0.971 | -0.443 | -0.249 |
| 6.044424265506525 | -0.972 | -0.444 | -0.251 |
| 6.047565858160115 | -0.972 | -0.446 | -0.253 |
| 6.050707450813704 | -0.973 | -0.447 | -0.255 |
| 6.053849043467294 | -0.974 | -0.448 | -0.258 |
| 6.056990636120884 | -0.975 | -0.45 | -0.259 |
| 6.060132228774473 | -0.975 | -0.451 | -0.261 |
| 6.063273821428063 | -0.976 | -0.452 | -0.263 |
| 6.066415414081653 | -0.977 | -0.454 | -0.265 |
| 6.069557006735242 | -0.977 | -0.455 | -0.267 |
| 6.072698599388831 | -0.978 | -0.456 | -0.269 |
| 6.07584019204242 | -0.979 | -0.458 | -0.271 |
| 6.078981784696011 | -0.979 | -0.459 | -0.273 |
| 6.082123377349601 | -0.98 | -0.46 | -0.275 |
| 6.08526497000319 | -0.98 | -0.461 | -0.276 |
| 6.08840656265678 | -0.981 | -0.463 | -0.278 |
| 6.09154815531037 | -0.982 | -0.464 | -0.28 |
| 6.094689747963959 | -0.982 | -0.465 | -0.281 |
| 6.097831340617549 | -0.983 | -0.466 | -0.283 |
| 6.100972933271138 | -0.983 | -0.467 | -0.285 |
| 6.104114525924728 | -0.984 | -0.468 | -0.286 |
| 6.107256118578317 | -0.985 | -0.469 | -0.288 |
| 6.110397711231907 | -0.985 | -0.47 | -0.29 |
| 6.113539303885497 | -0.986 | -0.471 | -0.291 |
| 6.116680896539086 | -0.986 | -0.473 | -0.293 |
| 6.119822489192675 | -0.987 | -0.474 | -0.294 |
| 6.122964081846265 | -0.987 | -0.475 | -0.296 |
| 6.126105674499855 | -0.988 | -0.476 | -0.297 |
| 6.129247267153445 | -0.988 | -0.476 | -0.298 |
| 6.132388859807034 | -0.989 | -0.477 | -0.3 |
| 6.135530452460624 | -0.989 | -0.478 | -0.301 |
| 6.138672045114213 | -0.99 | -0.479 | -0.302 |
| 6.141813637767803 | -0.99 | -0.48 | -0.304 |
| 6.144955230421393 | -0.99 | -0.481 | -0.305 |
| 6.148096823074982 | -0.991 | -0.482 | -0.306 |
| 6.151238415728571 | -0.991 | -0.483 | -0.308 |
| 6.154380008382161 | -0.992 | -0.484 | -0.309 |
| 6.157521601035751 | -0.992 | -0.484 | -0.31 |
| 6.16066319368934 | -0.993 | -0.485 | -0.311 |
| 6.16380478634293 | -0.993 | -0.486 | -0.312 |
| 6.16694637899652 | -0.993 | -0.487 | -0.313 |
| 6.170087971650109 | -0.994 | -0.487 | -0.314 |
| 6.173229564303698 | -0.994 | -0.488 | -0.315 |
| 6.176371156957289 | -0.994 | -0.489 | -0.316 |
| 6.179512749610878 | -0.995 | -0.489 | -0.317 |
| 6.182654342264468 | -0.995 | -0.49 | -0.318 |
| 6.185795934918057 | -0.995 | -0.491 | -0.319 |
| 6.188937527571647 | -0.996 | -0.491 | -0.32 |
| 6.192079120225237 | -0.996 | -0.492 | -0.321 |
| 6.195220712878826 | -0.996 | -0.492 | -0.322 |
| 6.198362305532415 | -0.996 | -0.493 | -0.323 |
| 6.201503898186005 | -0.997 | -0.493 | -0.323 |
| 6.204645490839594 | -0.997 | -0.494 | -0.324 |
| 6.207787083493184 | -0.997 | -0.494 | -0.325 |
| 6.210928676146774 | -0.997 | -0.495 | -0.326 |
| 6.214070268800364 | -0.998 | -0.495 | -0.326 |
| 6.217211861453953 | -0.998 | -0.496 | -0.327 |
| 6.220353454107543 | -0.998 | -0.496 | -0.327 |
| 6.223495046761133 | -0.998 | -0.496 | -0.328 |
| 6.226636639414722 | -0.998 | -0.497 | -0.329 |
| 6.229778232068312 | -0.999 | -0.497 | -0.329 |
| 6.232919824721901 | -0.999 | -0.497 | -0.33 |
| 6.236061417375491 | -0.999 | -0.498 | -0.33 |
| 6.23920301002908 | -0.999 | -0.498 | -0.33 |
| 6.24234460268267 | -0.999 | -0.498 | -0.331 |
| 6.24548619533626 | -0.999 | -0.499 | -0.331 |
| 6.24862778798985 | -0.999 | -0.499 | -0.332 |
| 6.251769380643438 | -1 | -0.499 | -0.332 |
| 6.254910973297028 | -1 | -0.499 | -0.332 |
| 6.258052565950618 | -1 | -0.499 | -0.332 |
| 6.261194158604208 | -1 | -0.5 | -0.333 |
| 6.264335751257797 | -1 | -0.5 | -0.333 |
| 6.267477343911387 | -1 | -0.5 | -0.333 |
| 6.270618936564976 | -1 | -0.5 | -0.333 |
| 6.273760529218566 | -1 | -0.5 | -0.333 |
| 6.276902121872155 | -1 | -0.5 | -0.333 |
| 6.280043714525745 | -1 | -0.5 | -0.333 |
| 6.283185307179335 | -1 | -0.5 | -0.333 |